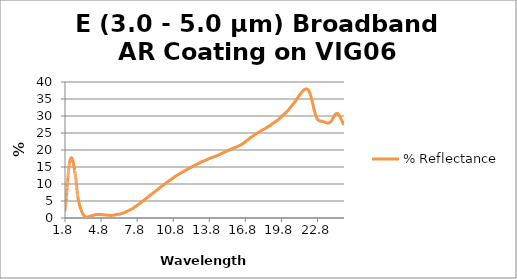
| Category | % Reflectance |
|---|---|
| 1.8 | 1.937 |
| 1.8045 | 2.139 |
| 1.809 | 2.139 |
| 1.8135 | 2.34 |
| 1.818 | 2.34 |
| 1.8225 | 2.561 |
| 1.827 | 2.561 |
| 1.8315 | 2.824 |
| 1.836 | 3.102 |
| 1.8405 | 3.102 |
| 1.845 | 3.387 |
| 1.8495 | 3.387 |
| 1.854 | 3.679 |
| 1.8585 | 3.679 |
| 1.863 | 3.979 |
| 1.8675 | 3.979 |
| 1.872 | 4.293 |
| 1.8765 | 4.615 |
| 1.881 | 4.615 |
| 1.8855 | 4.955 |
| 1.89 | 4.955 |
| 1.8945 | 5.295 |
| 1.899 | 5.295 |
| 1.9035 | 5.64 |
| 1.908 | 5.998 |
| 1.9125 | 5.998 |
| 1.917 | 6.351 |
| 1.9215 | 6.351 |
| 1.926 | 6.713 |
| 1.9305 | 6.713 |
| 1.935 | 7.086 |
| 1.9395 | 7.086 |
| 1.944 | 7.459 |
| 1.9485 | 7.832 |
| 1.953 | 7.832 |
| 1.9575 | 8.203 |
| 1.962 | 8.203 |
| 1.9665 | 8.58 |
| 1.971 | 8.58 |
| 1.9755 | 8.956 |
| 1.98 | 8.956 |
| 1.9845 | 9.327 |
| 1.989 | 9.7 |
| 1.9935 | 9.7 |
| 1.998 | 10.066 |
| 2.0025 | 10.066 |
| 2.007 | 10.426 |
| 2.0115 | 10.426 |
| 2.016 | 10.781 |
| 2.0205 | 11.134 |
| 2.025 | 11.134 |
| 2.0295 | 11.478 |
| 2.034 | 11.478 |
| 2.0385 | 11.82 |
| 2.043 | 11.82 |
| 2.0475 | 12.153 |
| 2.052 | 12.153 |
| 2.0565 | 12.466 |
| 2.061 | 12.778 |
| 2.0655 | 12.778 |
| 2.07 | 13.087 |
| 2.0745 | 13.087 |
| 2.079 | 13.384 |
| 2.0835 | 13.384 |
| 2.088 | 13.677 |
| 2.0925 | 13.677 |
| 2.097 | 13.957 |
| 2.1015 | 14.227 |
| 2.106 | 14.227 |
| 2.1105 | 14.485 |
| 2.115 | 14.485 |
| 2.1195 | 14.73 |
| 2.124 | 14.73 |
| 2.1285 | 14.97 |
| 2.133 | 14.97 |
| 2.1375 | 15.2 |
| 2.142 | 15.42 |
| 2.1465 | 15.42 |
| 2.151 | 15.626 |
| 2.1555 | 15.626 |
| 2.16 | 15.824 |
| 2.1645 | 15.824 |
| 2.169 | 16.016 |
| 2.1735 | 16.195 |
| 2.178 | 16.195 |
| 2.1825 | 16.36 |
| 2.187 | 16.36 |
| 2.1915 | 16.517 |
| 2.196 | 16.517 |
| 2.2005 | 16.664 |
| 2.205 | 16.664 |
| 2.2095 | 16.797 |
| 2.214 | 16.926 |
| 2.2185 | 16.926 |
| 2.223 | 17.049 |
| 2.2275 | 17.049 |
| 2.232 | 17.158 |
| 2.2365 | 17.158 |
| 2.241 | 17.253 |
| 2.2455 | 17.253 |
| 2.25 | 17.34 |
| 2.2545 | 17.42 |
| 2.259 | 17.42 |
| 2.2635 | 17.49 |
| 2.268 | 17.49 |
| 2.2725 | 17.55 |
| 2.277 | 17.55 |
| 2.2815 | 17.6 |
| 2.286 | 17.6 |
| 2.2905 | 17.638 |
| 2.295 | 17.672 |
| 2.2995 | 17.672 |
| 2.304 | 17.697 |
| 2.3085 | 17.697 |
| 2.313 | 17.708 |
| 2.3175 | 17.708 |
| 2.322 | 17.718 |
| 2.3265 | 17.716 |
| 2.331 | 17.716 |
| 2.3355 | 17.7 |
| 2.34 | 17.7 |
| 2.3445 | 17.681 |
| 2.349 | 17.681 |
| 2.3535 | 17.652 |
| 2.358 | 17.652 |
| 2.3625 | 17.616 |
| 2.367 | 17.579 |
| 2.3715 | 17.579 |
| 2.376 | 17.533 |
| 2.3805 | 17.533 |
| 2.385 | 17.481 |
| 2.3895 | 17.481 |
| 2.394 | 17.418 |
| 2.3985 | 17.418 |
| 2.403 | 17.343 |
| 2.4075 | 17.266 |
| 2.412 | 17.266 |
| 2.4165 | 17.185 |
| 2.421 | 17.185 |
| 2.4255 | 17.095 |
| 2.43 | 17.095 |
| 2.4345 | 17 |
| 2.439 | 17 |
| 2.4435 | 16.899 |
| 2.448 | 16.79 |
| 2.4525 | 16.79 |
| 2.457 | 16.681 |
| 2.4615 | 16.681 |
| 2.466 | 16.568 |
| 2.4705 | 16.568 |
| 2.475 | 16.442 |
| 2.4795 | 16.316 |
| 2.484 | 16.316 |
| 2.4885 | 16.186 |
| 2.493 | 16.186 |
| 2.4975 | 16.052 |
| 2.502 | 16.052 |
| 2.5065 | 15.914 |
| 2.511 | 15.914 |
| 2.5155 | 15.769 |
| 2.52 | 15.619 |
| 2.5245 | 15.619 |
| 2.529 | 15.463 |
| 2.5335 | 15.463 |
| 2.538 | 15.308 |
| 2.5425 | 15.308 |
| 2.547 | 15.153 |
| 2.5515 | 15.153 |
| 2.556 | 14.999 |
| 2.5605 | 14.834 |
| 2.565 | 14.834 |
| 2.5695 | 14.662 |
| 2.574 | 14.662 |
| 2.5785 | 14.495 |
| 2.583 | 14.495 |
| 2.5875 | 14.32 |
| 2.592 | 14.136 |
| 2.5965 | 14.136 |
| 2.601 | 13.956 |
| 2.6055 | 13.956 |
| 2.61 | 13.781 |
| 2.6145 | 13.781 |
| 2.619 | 13.591 |
| 2.6235 | 13.591 |
| 2.628 | 13.394 |
| 2.6325 | 13.203 |
| 2.637 | 13.203 |
| 2.6415 | 13.004 |
| 2.646 | 13.004 |
| 2.6505 | 12.81 |
| 2.655 | 12.81 |
| 2.6595 | 12.621 |
| 2.664 | 12.621 |
| 2.6685 | 12.419 |
| 2.673 | 12.202 |
| 2.6775 | 12.202 |
| 2.682 | 11.984 |
| 2.6865 | 11.984 |
| 2.691 | 11.758 |
| 2.6955 | 11.758 |
| 2.7 | 11.521 |
| 2.7045 | 11.521 |
| 2.709 | 11.278 |
| 2.7135 | 11.04 |
| 2.718 | 11.04 |
| 2.7225 | 10.791 |
| 2.727 | 10.791 |
| 2.7315 | 10.527 |
| 2.736 | 10.527 |
| 2.7405 | 10.256 |
| 2.745 | 9.973 |
| 2.7495 | 9.973 |
| 2.754 | 9.659 |
| 2.7585 | 9.659 |
| 2.763 | 9.345 |
| 2.7675 | 9.345 |
| 2.772 | 9.067 |
| 2.7765 | 9.067 |
| 2.781 | 8.784 |
| 2.7855 | 8.481 |
| 2.79 | 8.481 |
| 2.7945 | 8.181 |
| 2.799 | 8.181 |
| 2.8035 | 7.898 |
| 2.808 | 7.898 |
| 2.8125 | 7.626 |
| 2.817 | 7.626 |
| 2.8215 | 7.373 |
| 2.826 | 7.136 |
| 2.8305 | 7.136 |
| 2.835 | 6.91 |
| 2.8395 | 6.91 |
| 2.844 | 6.705 |
| 2.8485 | 6.705 |
| 2.853 | 6.514 |
| 2.8575 | 6.514 |
| 2.862 | 6.323 |
| 2.8665 | 6.142 |
| 2.871 | 6.142 |
| 2.8755 | 5.969 |
| 2.88 | 5.969 |
| 2.8845 | 5.796 |
| 2.889 | 5.796 |
| 2.8935 | 5.629 |
| 2.898 | 5.473 |
| 2.9025 | 5.473 |
| 2.907 | 5.321 |
| 2.9115 | 5.321 |
| 2.916 | 5.174 |
| 2.9205 | 5.174 |
| 2.925 | 5.037 |
| 2.9295 | 5.037 |
| 2.934 | 4.905 |
| 2.9385 | 4.776 |
| 2.943 | 4.776 |
| 2.9475 | 4.65 |
| 2.952 | 4.65 |
| 2.9565 | 4.531 |
| 2.961 | 4.531 |
| 2.9655 | 4.417 |
| 2.97 | 4.417 |
| 2.9745 | 4.304 |
| 2.979 | 4.192 |
| 2.9835 | 4.192 |
| 2.988 | 4.085 |
| 2.9925 | 4.085 |
| 2.997 | 3.982 |
| 3.0015 | 3.982 |
| 3.006 | 3.878 |
| 3.0105 | 3.878 |
| 3.015 | 3.777 |
| 3.0195 | 3.675 |
| 3.024 | 3.675 |
| 3.0285 | 3.574 |
| 3.033 | 3.574 |
| 3.0375 | 3.474 |
| 3.042 | 3.474 |
| 3.0465 | 3.374 |
| 3.051 | 3.28 |
| 3.0555 | 3.28 |
| 3.06 | 3.189 |
| 3.0645 | 3.189 |
| 3.069 | 3.095 |
| 3.0735 | 3.095 |
| 3.078 | 3.001 |
| 3.0825 | 3.001 |
| 3.087 | 2.913 |
| 3.0915 | 2.831 |
| 3.096 | 2.831 |
| 3.1005 | 2.743 |
| 3.105 | 2.743 |
| 3.1095 | 2.658 |
| 3.114 | 2.658 |
| 3.1185 | 2.581 |
| 3.123 | 2.581 |
| 3.1275 | 2.502 |
| 3.132 | 2.421 |
| 3.1365 | 2.421 |
| 3.141 | 2.348 |
| 3.1455 | 2.348 |
| 3.15 | 2.274 |
| 3.1545 | 2.274 |
| 3.159 | 2.2 |
| 3.1635 | 2.2 |
| 3.168 | 2.127 |
| 3.1725 | 2.051 |
| 3.177 | 2.051 |
| 3.1815 | 1.981 |
| 3.186 | 1.981 |
| 3.1905 | 1.911 |
| 3.195 | 1.911 |
| 3.1995 | 1.842 |
| 3.204 | 1.779 |
| 3.2085 | 1.779 |
| 3.213 | 1.716 |
| 3.2175 | 1.716 |
| 3.222 | 1.649 |
| 3.2265 | 1.649 |
| 3.231 | 1.585 |
| 3.2355 | 1.585 |
| 3.24 | 1.526 |
| 3.2445 | 1.463 |
| 3.249 | 1.463 |
| 3.2535 | 1.402 |
| 3.258 | 1.402 |
| 3.2625 | 1.347 |
| 3.267 | 1.347 |
| 3.2715 | 1.294 |
| 3.276 | 1.294 |
| 3.2805 | 1.239 |
| 3.285 | 1.188 |
| 3.2895 | 1.188 |
| 3.294 | 1.139 |
| 3.2985 | 1.139 |
| 3.303 | 1.091 |
| 3.3075 | 1.091 |
| 3.312 | 1.04 |
| 3.3165 | 0.992 |
| 3.321 | 0.992 |
| 3.3255 | 0.953 |
| 3.33 | 0.953 |
| 3.3345 | 0.91 |
| 3.339 | 0.91 |
| 3.3435 | 0.864 |
| 3.348 | 0.864 |
| 3.3525 | 0.818 |
| 3.357 | 0.774 |
| 3.3615 | 0.774 |
| 3.366 | 0.733 |
| 3.3705 | 0.733 |
| 3.375 | 0.699 |
| 3.3795 | 0.699 |
| 3.384 | 0.669 |
| 3.3885 | 0.669 |
| 3.393 | 0.635 |
| 3.3975 | 0.601 |
| 3.402 | 0.601 |
| 3.4065 | 0.571 |
| 3.411 | 0.571 |
| 3.4155 | 0.552 |
| 3.42 | 0.552 |
| 3.4245 | 0.537 |
| 3.429 | 0.537 |
| 3.4335 | 0.521 |
| 3.438 | 0.503 |
| 3.4425 | 0.503 |
| 3.447 | 0.485 |
| 3.4515 | 0.485 |
| 3.456 | 0.464 |
| 3.4605 | 0.464 |
| 3.465 | 0.44 |
| 3.4695 | 0.42 |
| 3.474 | 0.42 |
| 3.4785 | 0.401 |
| 3.483 | 0.401 |
| 3.4875 | 0.384 |
| 3.492 | 0.384 |
| 3.4965 | 0.368 |
| 3.501 | 0.368 |
| 3.5055 | 0.357 |
| 3.51 | 0.35 |
| 3.5145 | 0.35 |
| 3.519 | 0.342 |
| 3.5235 | 0.342 |
| 3.528 | 0.331 |
| 3.5325 | 0.331 |
| 3.537 | 0.32 |
| 3.5415 | 0.32 |
| 3.546 | 0.315 |
| 3.5505 | 0.309 |
| 3.555 | 0.309 |
| 3.5595 | 0.297 |
| 3.564 | 0.297 |
| 3.5685 | 0.289 |
| 3.573 | 0.289 |
| 3.5775 | 0.286 |
| 3.582 | 0.286 |
| 3.5865 | 0.284 |
| 3.591 | 0.28 |
| 3.5955 | 0.28 |
| 3.6 | 0.276 |
| 3.6045 | 0.276 |
| 3.609 | 0.273 |
| 3.6135 | 0.273 |
| 3.618 | 0.272 |
| 3.6225 | 0.27 |
| 3.627 | 0.27 |
| 3.6315 | 0.268 |
| 3.636 | 0.268 |
| 3.6405 | 0.266 |
| 3.645 | 0.266 |
| 3.6495 | 0.268 |
| 3.654 | 0.268 |
| 3.6585 | 0.269 |
| 3.663 | 0.271 |
| 3.6675 | 0.271 |
| 3.672 | 0.275 |
| 3.6765 | 0.275 |
| 3.681 | 0.279 |
| 3.6855 | 0.279 |
| 3.69 | 0.284 |
| 3.6945 | 0.284 |
| 3.699 | 0.288 |
| 3.7035 | 0.292 |
| 3.708 | 0.292 |
| 3.7125 | 0.297 |
| 3.717 | 0.297 |
| 3.7215 | 0.299 |
| 3.726 | 0.299 |
| 3.7305 | 0.304 |
| 3.735 | 0.304 |
| 3.7395 | 0.312 |
| 3.744 | 0.319 |
| 3.7485 | 0.319 |
| 3.753 | 0.326 |
| 3.7575 | 0.326 |
| 3.762 | 0.334 |
| 3.7665 | 0.334 |
| 3.771 | 0.342 |
| 3.7755 | 0.348 |
| 3.78 | 0.348 |
| 3.7845 | 0.356 |
| 3.789 | 0.356 |
| 3.7935 | 0.362 |
| 3.798 | 0.362 |
| 3.8025 | 0.372 |
| 3.807 | 0.372 |
| 3.8115 | 0.384 |
| 3.816 | 0.391 |
| 3.8205 | 0.391 |
| 3.825 | 0.402 |
| 3.8295 | 0.402 |
| 3.834 | 0.413 |
| 3.8385 | 0.413 |
| 3.843 | 0.423 |
| 3.8475 | 0.423 |
| 3.852 | 0.433 |
| 3.8565 | 0.444 |
| 3.861 | 0.444 |
| 3.8655 | 0.453 |
| 3.87 | 0.453 |
| 3.8745 | 0.464 |
| 3.879 | 0.464 |
| 3.8835 | 0.476 |
| 3.888 | 0.486 |
| 3.8925 | 0.486 |
| 3.897 | 0.496 |
| 3.9015 | 0.496 |
| 3.906 | 0.507 |
| 3.9105 | 0.507 |
| 3.915 | 0.519 |
| 3.9195 | 0.519 |
| 3.924 | 0.527 |
| 3.9285 | 0.536 |
| 3.933 | 0.536 |
| 3.9375 | 0.547 |
| 3.942 | 0.547 |
| 3.9465 | 0.557 |
| 3.951 | 0.557 |
| 3.9555 | 0.567 |
| 3.96 | 0.567 |
| 3.9645 | 0.577 |
| 3.969 | 0.588 |
| 3.9735 | 0.588 |
| 3.978 | 0.597 |
| 3.9825 | 0.597 |
| 3.987 | 0.605 |
| 3.9915 | 0.605 |
| 3.996 | 0.616 |
| 4.0005 | 0.616 |
| 4.005 | 0.627 |
| 4.0095 | 0.637 |
| 4.014 | 0.637 |
| 4.0185 | 0.648 |
| 4.023 | 0.648 |
| 4.0275 | 0.655 |
| 4.032 | 0.655 |
| 4.0365 | 0.664 |
| 4.041 | 0.674 |
| 4.0455 | 0.674 |
| 4.05 | 0.684 |
| 4.0545 | 0.684 |
| 4.059 | 0.694 |
| 4.0635 | 0.694 |
| 4.068 | 0.705 |
| 4.0725 | 0.705 |
| 4.077 | 0.715 |
| 4.0815 | 0.722 |
| 4.086 | 0.722 |
| 4.0905 | 0.732 |
| 4.095 | 0.732 |
| 4.0995 | 0.74 |
| 4.104 | 0.74 |
| 4.1085 | 0.749 |
| 4.113 | 0.749 |
| 4.1175 | 0.76 |
| 4.122 | 0.771 |
| 4.1265 | 0.771 |
| 4.131 | 0.779 |
| 4.1355 | 0.779 |
| 4.14 | 0.788 |
| 4.1445 | 0.788 |
| 4.149 | 0.799 |
| 4.1535 | 0.799 |
| 4.158 | 0.806 |
| 4.1625 | 0.815 |
| 4.167 | 0.815 |
| 4.1715 | 0.826 |
| 4.176 | 0.826 |
| 4.1805 | 0.835 |
| 4.185 | 0.835 |
| 4.1895 | 0.844 |
| 4.194 | 0.853 |
| 4.1985 | 0.853 |
| 4.203 | 0.864 |
| 4.2075 | 0.864 |
| 4.212 | 0.875 |
| 4.2165 | 0.875 |
| 4.221 | 0.883 |
| 4.2255 | 0.883 |
| 4.23 | 0.889 |
| 4.2345 | 0.896 |
| 4.239 | 0.896 |
| 4.2435 | 0.903 |
| 4.248 | 0.903 |
| 4.2525 | 0.912 |
| 4.257 | 0.912 |
| 4.2615 | 0.919 |
| 4.266 | 0.919 |
| 4.2705 | 0.925 |
| 4.275 | 0.933 |
| 4.2795 | 0.933 |
| 4.284 | 0.94 |
| 4.2885 | 0.94 |
| 4.293 | 0.946 |
| 4.2975 | 0.946 |
| 4.302 | 0.951 |
| 4.3065 | 0.951 |
| 4.311 | 0.957 |
| 4.3155 | 0.964 |
| 4.32 | 0.964 |
| 4.3245 | 0.967 |
| 4.329 | 0.967 |
| 4.3335 | 0.97 |
| 4.338 | 0.97 |
| 4.3425 | 0.976 |
| 4.347 | 0.981 |
| 4.3515 | 0.981 |
| 4.356 | 0.987 |
| 4.3605 | 0.987 |
| 4.365 | 0.993 |
| 4.3695 | 0.993 |
| 4.374 | 0.998 |
| 4.3785 | 0.998 |
| 4.383 | 1.003 |
| 4.3875 | 1.006 |
| 4.392 | 1.006 |
| 4.3965 | 1.009 |
| 4.401 | 1.009 |
| 4.4055 | 1.011 |
| 4.41 | 1.011 |
| 4.4145 | 1.014 |
| 4.419 | 1.014 |
| 4.4235 | 1.02 |
| 4.428 | 1.024 |
| 4.4325 | 1.024 |
| 4.437 | 1.025 |
| 4.4415 | 1.025 |
| 4.446 | 1.025 |
| 4.4505 | 1.025 |
| 4.455 | 1.025 |
| 4.4595 | 1.025 |
| 4.464 | 1.025 |
| 4.4685 | 1.028 |
| 4.473 | 1.028 |
| 4.4775 | 1.032 |
| 4.482 | 1.032 |
| 4.4865 | 1.038 |
| 4.491 | 1.038 |
| 4.4955 | 1.039 |
| 4.5 | 1.04 |
| 4.5045 | 1.04 |
| 4.509 | 1.044 |
| 4.5135 | 1.044 |
| 4.518 | 1.046 |
| 4.5225 | 1.046 |
| 4.527 | 1.048 |
| 4.5315 | 1.048 |
| 4.536 | 1.048 |
| 4.5405 | 1.048 |
| 4.545 | 1.048 |
| 4.5495 | 1.051 |
| 4.554 | 1.051 |
| 4.5585 | 1.055 |
| 4.563 | 1.055 |
| 4.5675 | 1.055 |
| 4.572 | 1.055 |
| 4.5765 | 1.053 |
| 4.581 | 1.054 |
| 4.5855 | 1.054 |
| 4.59 | 1.058 |
| 4.5945 | 1.058 |
| 4.599 | 1.061 |
| 4.6035 | 1.061 |
| 4.608 | 1.06 |
| 4.6125 | 1.059 |
| 4.617 | 1.059 |
| 4.6215 | 1.058 |
| 4.626 | 1.058 |
| 4.6305 | 1.059 |
| 4.635 | 1.059 |
| 4.6395 | 1.058 |
| 4.644 | 1.058 |
| 4.6485 | 1.056 |
| 4.653 | 1.058 |
| 4.6575 | 1.058 |
| 4.662 | 1.059 |
| 4.6665 | 1.059 |
| 4.671 | 1.057 |
| 4.6755 | 1.057 |
| 4.68 | 1.057 |
| 4.6845 | 1.057 |
| 4.689 | 1.057 |
| 4.6935 | 1.056 |
| 4.698 | 1.056 |
| 4.7025 | 1.054 |
| 4.707 | 1.054 |
| 4.7115 | 1.052 |
| 4.716 | 1.052 |
| 4.7205 | 1.05 |
| 4.725 | 1.05 |
| 4.7295 | 1.049 |
| 4.734 | 1.048 |
| 4.7385 | 1.048 |
| 4.743 | 1.047 |
| 4.7475 | 1.047 |
| 4.752 | 1.046 |
| 4.7565 | 1.046 |
| 4.761 | 1.044 |
| 4.7655 | 1.042 |
| 4.77 | 1.042 |
| 4.7745 | 1.041 |
| 4.779 | 1.041 |
| 4.7835 | 1.039 |
| 4.788 | 1.039 |
| 4.7925 | 1.035 |
| 4.797 | 1.035 |
| 4.8015 | 1.031 |
| 4.806 | 1.03 |
| 4.8105 | 1.03 |
| 4.815 | 1.029 |
| 4.8195 | 1.029 |
| 4.824 | 1.025 |
| 4.8285 | 1.025 |
| 4.833 | 1.023 |
| 4.8375 | 1.023 |
| 4.842 | 1.022 |
| 4.8465 | 1.018 |
| 4.851 | 1.018 |
| 4.8555 | 1.013 |
| 4.86 | 1.013 |
| 4.8645 | 1.009 |
| 4.869 | 1.009 |
| 4.8735 | 1.006 |
| 4.878 | 1.006 |
| 4.8825 | 1.004 |
| 4.887 | 1.003 |
| 4.8915 | 1.003 |
| 4.896 | 1.001 |
| 4.9005 | 1.001 |
| 4.905 | 0.996 |
| 4.9095 | 0.996 |
| 4.914 | 0.99 |
| 4.9185 | 0.986 |
| 4.923 | 0.986 |
| 4.9275 | 0.983 |
| 4.932 | 0.983 |
| 4.9365 | 0.979 |
| 4.941 | 0.979 |
| 4.9455 | 0.976 |
| 4.95 | 0.976 |
| 4.9545 | 0.973 |
| 4.959 | 0.969 |
| 4.9635 | 0.969 |
| 4.968 | 0.965 |
| 4.9725 | 0.965 |
| 4.977 | 0.962 |
| 4.9815 | 0.962 |
| 4.986 | 0.959 |
| 4.9905 | 0.959 |
| 4.995 | 0.957 |
| 4.9995 | 0.953 |
| 5.004 | 0.953 |
| 5.0085 | 0.948 |
| 5.013 | 0.948 |
| 5.0175 | 0.945 |
| 5.022 | 0.945 |
| 5.0265 | 0.942 |
| 5.031 | 0.942 |
| 5.0355 | 0.935 |
| 5.04 | 0.929 |
| 5.0445 | 0.929 |
| 5.049 | 0.927 |
| 5.0535 | 0.927 |
| 5.058 | 0.925 |
| 5.0625 | 0.925 |
| 5.067 | 0.922 |
| 5.0715 | 0.92 |
| 5.076 | 0.92 |
| 5.0805 | 0.917 |
| 5.085 | 0.917 |
| 5.0895 | 0.912 |
| 5.094 | 0.912 |
| 5.0985 | 0.908 |
| 5.103 | 0.908 |
| 5.1075 | 0.904 |
| 5.112 | 0.899 |
| 5.1165 | 0.899 |
| 5.121 | 0.894 |
| 5.1255 | 0.894 |
| 5.13 | 0.891 |
| 5.1345 | 0.891 |
| 5.139 | 0.892 |
| 5.1435 | 0.892 |
| 5.148 | 0.892 |
| 5.1525 | 0.889 |
| 5.157 | 0.889 |
| 5.1615 | 0.886 |
| 5.166 | 0.886 |
| 5.1705 | 0.883 |
| 5.175 | 0.883 |
| 5.1795 | 0.879 |
| 5.184 | 0.874 |
| 5.1885 | 0.874 |
| 5.193 | 0.869 |
| 5.1975 | 0.869 |
| 5.202 | 0.865 |
| 5.2065 | 0.865 |
| 5.211 | 0.861 |
| 5.2155 | 0.861 |
| 5.22 | 0.858 |
| 5.2245 | 0.857 |
| 5.229 | 0.857 |
| 5.2335 | 0.856 |
| 5.238 | 0.856 |
| 5.2425 | 0.851 |
| 5.247 | 0.851 |
| 5.2515 | 0.848 |
| 5.256 | 0.848 |
| 5.2605 | 0.846 |
| 5.265 | 0.845 |
| 5.2695 | 0.845 |
| 5.274 | 0.843 |
| 5.2785 | 0.843 |
| 5.283 | 0.839 |
| 5.2875 | 0.839 |
| 5.292 | 0.835 |
| 5.2965 | 0.835 |
| 5.301 | 0.832 |
| 5.3055 | 0.829 |
| 5.31 | 0.829 |
| 5.3145 | 0.824 |
| 5.319 | 0.824 |
| 5.3235 | 0.821 |
| 5.328 | 0.821 |
| 5.3325 | 0.819 |
| 5.337 | 0.818 |
| 5.3415 | 0.818 |
| 5.346 | 0.817 |
| 5.3505 | 0.817 |
| 5.355 | 0.816 |
| 5.3595 | 0.816 |
| 5.364 | 0.816 |
| 5.3685 | 0.816 |
| 5.373 | 0.813 |
| 5.3775 | 0.809 |
| 5.382 | 0.809 |
| 5.3865 | 0.806 |
| 5.391 | 0.806 |
| 5.3955 | 0.805 |
| 5.4 | 0.805 |
| 5.4045 | 0.803 |
| 5.409 | 0.803 |
| 5.4135 | 0.802 |
| 5.418 | 0.8 |
| 5.4225 | 0.8 |
| 5.427 | 0.798 |
| 5.4315 | 0.798 |
| 5.436 | 0.795 |
| 5.4405 | 0.795 |
| 5.445 | 0.793 |
| 5.4495 | 0.793 |
| 5.454 | 0.79 |
| 5.4585 | 0.787 |
| 5.463 | 0.787 |
| 5.4675 | 0.783 |
| 5.472 | 0.783 |
| 5.4765 | 0.781 |
| 5.481 | 0.781 |
| 5.4855 | 0.78 |
| 5.49 | 0.78 |
| 5.4945 | 0.78 |
| 5.499 | 0.779 |
| 5.5035 | 0.779 |
| 5.508 | 0.778 |
| 5.5125 | 0.778 |
| 5.517 | 0.777 |
| 5.5215 | 0.777 |
| 5.526 | 0.775 |
| 5.5305 | 0.773 |
| 5.535 | 0.773 |
| 5.5395 | 0.772 |
| 5.544 | 0.772 |
| 5.5485 | 0.771 |
| 5.553 | 0.771 |
| 5.5575 | 0.769 |
| 5.562 | 0.769 |
| 5.5665 | 0.767 |
| 5.571 | 0.766 |
| 5.5755 | 0.766 |
| 5.58 | 0.763 |
| 5.5845 | 0.763 |
| 5.589 | 0.76 |
| 5.5935 | 0.76 |
| 5.598 | 0.761 |
| 5.6025 | 0.761 |
| 5.607 | 0.764 |
| 5.6115 | 0.767 |
| 5.616 | 0.767 |
| 5.6205 | 0.769 |
| 5.625 | 0.769 |
| 5.6295 | 0.769 |
| 5.634 | 0.769 |
| 5.6385 | 0.769 |
| 5.643 | 0.767 |
| 5.6475 | 0.767 |
| 5.652 | 0.766 |
| 5.6565 | 0.766 |
| 5.661 | 0.765 |
| 5.6655 | 0.765 |
| 5.67 | 0.765 |
| 5.6745 | 0.765 |
| 5.679 | 0.764 |
| 5.6835 | 0.765 |
| 5.688 | 0.765 |
| 5.6925 | 0.769 |
| 5.697 | 0.769 |
| 5.7015 | 0.773 |
| 5.706 | 0.773 |
| 5.7105 | 0.776 |
| 5.715 | 0.776 |
| 5.7195 | 0.778 |
| 5.724 | 0.779 |
| 5.7285 | 0.779 |
| 5.733 | 0.781 |
| 5.7375 | 0.781 |
| 5.742 | 0.781 |
| 5.7465 | 0.781 |
| 5.751 | 0.782 |
| 5.7555 | 0.782 |
| 5.76 | 0.784 |
| 5.7645 | 0.789 |
| 5.769 | 0.789 |
| 5.7735 | 0.793 |
| 5.778 | 0.793 |
| 5.7825 | 0.794 |
| 5.787 | 0.794 |
| 5.7915 | 0.794 |
| 5.796 | 0.798 |
| 5.8005 | 0.798 |
| 5.805 | 0.805 |
| 5.8095 | 0.805 |
| 5.814 | 0.813 |
| 5.8185 | 0.813 |
| 5.823 | 0.819 |
| 5.8275 | 0.819 |
| 5.832 | 0.823 |
| 5.8365 | 0.826 |
| 5.841 | 0.826 |
| 5.8455 | 0.829 |
| 5.85 | 0.829 |
| 5.8545 | 0.833 |
| 5.859 | 0.833 |
| 5.8635 | 0.838 |
| 5.868 | 0.838 |
| 5.8725 | 0.843 |
| 5.877 | 0.848 |
| 5.8815 | 0.848 |
| 5.886 | 0.853 |
| 5.8905 | 0.853 |
| 5.895 | 0.859 |
| 5.8995 | 0.859 |
| 5.904 | 0.867 |
| 5.9085 | 0.877 |
| 5.913 | 0.877 |
| 5.9175 | 0.886 |
| 5.922 | 0.886 |
| 5.9265 | 0.894 |
| 5.931 | 0.894 |
| 5.9355 | 0.903 |
| 5.94 | 0.903 |
| 5.9445 | 0.911 |
| 5.949 | 0.92 |
| 5.9535 | 0.92 |
| 5.958 | 0.93 |
| 5.9625 | 0.93 |
| 5.967 | 0.94 |
| 5.9715 | 0.94 |
| 5.976 | 0.95 |
| 5.9805 | 0.95 |
| 5.985 | 0.959 |
| 5.9895 | 0.966 |
| 5.994 | 0.966 |
| 5.9985 | 0.972 |
| 6.003 | 0.972 |
| 6.0075 | 0.979 |
| 6.012 | 0.979 |
| 6.0165 | 0.988 |
| 6.021 | 0.988 |
| 6.0255 | 0.997 |
| 6.03 | 1.006 |
| 6.0345 | 1.006 |
| 6.039 | 1.016 |
| 6.0435 | 1.016 |
| 6.048 | 1.024 |
| 6.0525 | 1.024 |
| 6.057 | 1.029 |
| 6.0615 | 1.033 |
| 6.066 | 1.033 |
| 6.0705 | 1.038 |
| 6.075 | 1.038 |
| 6.0795 | 1.043 |
| 6.084 | 1.043 |
| 6.0885 | 1.048 |
| 6.093 | 1.048 |
| 6.0975 | 1.053 |
| 6.102 | 1.056 |
| 6.1065 | 1.056 |
| 6.111 | 1.058 |
| 6.1155 | 1.058 |
| 6.12 | 1.06 |
| 6.1245 | 1.06 |
| 6.129 | 1.061 |
| 6.1335 | 1.061 |
| 6.138 | 1.064 |
| 6.1425 | 1.067 |
| 6.147 | 1.067 |
| 6.1515 | 1.068 |
| 6.156 | 1.068 |
| 6.1605 | 1.067 |
| 6.165 | 1.067 |
| 6.1695 | 1.068 |
| 6.174 | 1.068 |
| 6.1785 | 1.072 |
| 6.183 | 1.076 |
| 6.1875 | 1.076 |
| 6.192 | 1.077 |
| 6.1965 | 1.077 |
| 6.201 | 1.076 |
| 6.2055 | 1.076 |
| 6.21 | 1.075 |
| 6.2145 | 1.075 |
| 6.219 | 1.075 |
| 6.2235 | 1.075 |
| 6.228 | 1.075 |
| 6.2325 | 1.077 |
| 6.237 | 1.077 |
| 6.2415 | 1.079 |
| 6.246 | 1.079 |
| 6.2505 | 1.083 |
| 6.255 | 1.088 |
| 6.2595 | 1.088 |
| 6.264 | 1.091 |
| 6.2685 | 1.091 |
| 6.273 | 1.093 |
| 6.2775 | 1.093 |
| 6.282 | 1.094 |
| 6.2865 | 1.094 |
| 6.291 | 1.095 |
| 6.2955 | 1.097 |
| 6.3 | 1.097 |
| 6.3045 | 1.101 |
| 6.309 | 1.101 |
| 6.3135 | 1.105 |
| 6.318 | 1.105 |
| 6.3225 | 1.11 |
| 6.327 | 1.11 |
| 6.3315 | 1.117 |
| 6.336 | 1.124 |
| 6.3405 | 1.124 |
| 6.345 | 1.132 |
| 6.3495 | 1.132 |
| 6.354 | 1.138 |
| 6.3585 | 1.138 |
| 6.363 | 1.143 |
| 6.3675 | 1.148 |
| 6.372 | 1.148 |
| 6.3765 | 1.155 |
| 6.381 | 1.155 |
| 6.3855 | 1.163 |
| 6.39 | 1.163 |
| 6.3945 | 1.17 |
| 6.399 | 1.17 |
| 6.4035 | 1.179 |
| 6.408 | 1.188 |
| 6.4125 | 1.188 |
| 6.417 | 1.199 |
| 6.4215 | 1.199 |
| 6.426 | 1.207 |
| 6.4305 | 1.207 |
| 6.435 | 1.213 |
| 6.4395 | 1.213 |
| 6.444 | 1.218 |
| 6.4485 | 1.224 |
| 6.453 | 1.224 |
| 6.4575 | 1.231 |
| 6.462 | 1.231 |
| 6.4665 | 1.239 |
| 6.471 | 1.239 |
| 6.4755 | 1.249 |
| 6.48 | 1.259 |
| 6.4845 | 1.259 |
| 6.489 | 1.268 |
| 6.4935 | 1.268 |
| 6.498 | 1.277 |
| 6.5025 | 1.277 |
| 6.507 | 1.286 |
| 6.5115 | 1.286 |
| 6.516 | 1.297 |
| 6.5205 | 1.307 |
| 6.525 | 1.307 |
| 6.5295 | 1.316 |
| 6.534 | 1.316 |
| 6.5385 | 1.325 |
| 6.543 | 1.325 |
| 6.5475 | 1.333 |
| 6.552 | 1.333 |
| 6.5565 | 1.343 |
| 6.561 | 1.354 |
| 6.5655 | 1.354 |
| 6.57 | 1.364 |
| 6.5745 | 1.364 |
| 6.579 | 1.373 |
| 6.5835 | 1.373 |
| 6.588 | 1.383 |
| 6.5925 | 1.383 |
| 6.597 | 1.393 |
| 6.6015 | 1.404 |
| 6.606 | 1.404 |
| 6.6105 | 1.416 |
| 6.615 | 1.416 |
| 6.6195 | 1.427 |
| 6.624 | 1.427 |
| 6.6285 | 1.439 |
| 6.633 | 1.45 |
| 6.6375 | 1.45 |
| 6.642 | 1.461 |
| 6.6465 | 1.461 |
| 6.651 | 1.472 |
| 6.6555 | 1.472 |
| 6.66 | 1.484 |
| 6.6645 | 1.484 |
| 6.669 | 1.497 |
| 6.6735 | 1.508 |
| 6.678 | 1.508 |
| 6.6825 | 1.519 |
| 6.687 | 1.519 |
| 6.6915 | 1.529 |
| 6.696 | 1.529 |
| 6.7005 | 1.541 |
| 6.705 | 1.541 |
| 6.7095 | 1.554 |
| 6.714 | 1.568 |
| 6.7185 | 1.568 |
| 6.723 | 1.582 |
| 6.7275 | 1.582 |
| 6.732 | 1.595 |
| 6.7365 | 1.595 |
| 6.741 | 1.606 |
| 6.7455 | 1.606 |
| 6.75 | 1.618 |
| 6.7545 | 1.632 |
| 6.759 | 1.632 |
| 6.7635 | 1.648 |
| 6.768 | 1.648 |
| 6.7725 | 1.664 |
| 6.777 | 1.664 |
| 6.7815 | 1.679 |
| 6.786 | 1.692 |
| 6.7905 | 1.692 |
| 6.795 | 1.702 |
| 6.7995 | 1.702 |
| 6.804 | 1.712 |
| 6.8085 | 1.712 |
| 6.813 | 1.723 |
| 6.8175 | 1.723 |
| 6.822 | 1.735 |
| 6.8265 | 1.747 |
| 6.831 | 1.747 |
| 6.8355 | 1.76 |
| 6.84 | 1.76 |
| 6.8445 | 1.773 |
| 6.849 | 1.773 |
| 6.8535 | 1.787 |
| 6.858 | 1.787 |
| 6.8625 | 1.803 |
| 6.867 | 1.819 |
| 6.8715 | 1.819 |
| 6.876 | 1.834 |
| 6.8805 | 1.834 |
| 6.885 | 1.848 |
| 6.8895 | 1.848 |
| 6.894 | 1.861 |
| 6.8985 | 1.861 |
| 6.903 | 1.873 |
| 6.9075 | 1.885 |
| 6.912 | 1.885 |
| 6.9165 | 1.898 |
| 6.921 | 1.898 |
| 6.9255 | 1.912 |
| 6.93 | 1.912 |
| 6.9345 | 1.928 |
| 6.939 | 1.942 |
| 6.9435 | 1.942 |
| 6.948 | 1.957 |
| 6.9525 | 1.957 |
| 6.957 | 1.97 |
| 6.9615 | 1.97 |
| 6.966 | 1.983 |
| 6.9705 | 1.983 |
| 6.975 | 1.995 |
| 6.9795 | 2.006 |
| 6.984 | 2.006 |
| 6.9885 | 2.018 |
| 6.993 | 2.018 |
| 6.9975 | 2.031 |
| 7.002 | 2.031 |
| 7.0065 | 2.043 |
| 7.011 | 2.043 |
| 7.0155 | 2.055 |
| 7.02 | 2.066 |
| 7.0245 | 2.066 |
| 7.029 | 2.077 |
| 7.0335 | 2.077 |
| 7.038 | 2.088 |
| 7.0425 | 2.088 |
| 7.047 | 2.1 |
| 7.0515 | 2.1 |
| 7.056 | 2.112 |
| 7.0605 | 2.125 |
| 7.065 | 2.125 |
| 7.0695 | 2.138 |
| 7.074 | 2.138 |
| 7.0785 | 2.151 |
| 7.083 | 2.151 |
| 7.0875 | 2.164 |
| 7.092 | 2.177 |
| 7.0965 | 2.177 |
| 7.101 | 2.191 |
| 7.1055 | 2.191 |
| 7.11 | 2.205 |
| 7.1145 | 2.205 |
| 7.119 | 2.219 |
| 7.1235 | 2.219 |
| 7.128 | 2.231 |
| 7.1325 | 2.242 |
| 7.137 | 2.242 |
| 7.1415 | 2.255 |
| 7.146 | 2.255 |
| 7.1505 | 2.268 |
| 7.155 | 2.268 |
| 7.1595 | 2.282 |
| 7.164 | 2.282 |
| 7.1685 | 2.297 |
| 7.173 | 2.313 |
| 7.1775 | 2.313 |
| 7.182 | 2.33 |
| 7.1865 | 2.33 |
| 7.191 | 2.346 |
| 7.1955 | 2.346 |
| 7.2 | 2.361 |
| 7.2045 | 2.376 |
| 7.209 | 2.376 |
| 7.2135 | 2.391 |
| 7.218 | 2.391 |
| 7.2225 | 2.406 |
| 7.227 | 2.406 |
| 7.2315 | 2.423 |
| 7.236 | 2.423 |
| 7.2405 | 2.439 |
| 7.245 | 2.454 |
| 7.2495 | 2.454 |
| 7.254 | 2.468 |
| 7.2585 | 2.468 |
| 7.263 | 2.482 |
| 7.2675 | 2.482 |
| 7.272 | 2.496 |
| 7.2765 | 2.496 |
| 7.281 | 2.51 |
| 7.2855 | 2.524 |
| 7.29 | 2.524 |
| 7.2945 | 2.539 |
| 7.299 | 2.539 |
| 7.3035 | 2.554 |
| 7.308 | 2.554 |
| 7.3125 | 2.569 |
| 7.317 | 2.569 |
| 7.3215 | 2.584 |
| 7.326 | 2.599 |
| 7.3305 | 2.599 |
| 7.335 | 2.615 |
| 7.3395 | 2.615 |
| 7.344 | 2.63 |
| 7.3485 | 2.63 |
| 7.353 | 2.646 |
| 7.3575 | 2.661 |
| 7.362 | 2.661 |
| 7.3665 | 2.677 |
| 7.371 | 2.677 |
| 7.3755 | 2.695 |
| 7.38 | 2.695 |
| 7.3845 | 2.714 |
| 7.389 | 2.714 |
| 7.3935 | 2.734 |
| 7.398 | 2.755 |
| 7.4025 | 2.755 |
| 7.407 | 2.774 |
| 7.4115 | 2.774 |
| 7.416 | 2.793 |
| 7.4205 | 2.793 |
| 7.425 | 2.811 |
| 7.4295 | 2.811 |
| 7.434 | 2.829 |
| 7.4385 | 2.846 |
| 7.443 | 2.846 |
| 7.4475 | 2.863 |
| 7.452 | 2.863 |
| 7.4565 | 2.88 |
| 7.461 | 2.88 |
| 7.4655 | 2.897 |
| 7.47 | 2.897 |
| 7.4745 | 2.915 |
| 7.479 | 2.933 |
| 7.4835 | 2.933 |
| 7.488 | 2.952 |
| 7.4925 | 2.952 |
| 7.497 | 2.971 |
| 7.5015 | 2.971 |
| 7.506 | 2.99 |
| 7.5105 | 3.01 |
| 7.515 | 3.01 |
| 7.5195 | 3.031 |
| 7.524 | 3.031 |
| 7.5285 | 3.052 |
| 7.533 | 3.052 |
| 7.5375 | 3.073 |
| 7.542 | 3.073 |
| 7.5465 | 3.094 |
| 7.551 | 3.114 |
| 7.5555 | 3.114 |
| 7.56 | 3.133 |
| 7.5645 | 3.133 |
| 7.569 | 3.151 |
| 7.5735 | 3.151 |
| 7.578 | 3.17 |
| 7.5825 | 3.17 |
| 7.587 | 3.189 |
| 7.5915 | 3.209 |
| 7.596 | 3.209 |
| 7.6005 | 3.23 |
| 7.605 | 3.23 |
| 7.6095 | 3.252 |
| 7.614 | 3.252 |
| 7.6185 | 3.274 |
| 7.623 | 3.274 |
| 7.6275 | 3.295 |
| 7.632 | 3.317 |
| 7.6365 | 3.317 |
| 7.641 | 3.339 |
| 7.6455 | 3.339 |
| 7.65 | 3.36 |
| 7.6545 | 3.36 |
| 7.659 | 3.379 |
| 7.6635 | 3.397 |
| 7.668 | 3.397 |
| 7.6725 | 3.414 |
| 7.677 | 3.414 |
| 7.6815 | 3.431 |
| 7.686 | 3.431 |
| 7.6905 | 3.45 |
| 7.695 | 3.45 |
| 7.6995 | 3.471 |
| 7.704 | 3.493 |
| 7.7085 | 3.493 |
| 7.713 | 3.514 |
| 7.7175 | 3.514 |
| 7.722 | 3.534 |
| 7.7265 | 3.534 |
| 7.731 | 3.555 |
| 7.7355 | 3.555 |
| 7.74 | 3.575 |
| 7.7445 | 3.595 |
| 7.749 | 3.595 |
| 7.7535 | 3.616 |
| 7.758 | 3.616 |
| 7.7625 | 3.638 |
| 7.767 | 3.638 |
| 7.7715 | 3.66 |
| 7.776 | 3.68 |
| 7.7805 | 3.68 |
| 7.785 | 3.701 |
| 7.7895 | 3.701 |
| 7.794 | 3.72 |
| 7.7985 | 3.72 |
| 7.803 | 3.741 |
| 7.8075 | 3.741 |
| 7.812 | 3.762 |
| 7.8165 | 3.783 |
| 7.821 | 3.783 |
| 7.8255 | 3.804 |
| 7.83 | 3.804 |
| 7.8345 | 3.825 |
| 7.839 | 3.825 |
| 7.8435 | 3.845 |
| 7.848 | 3.845 |
| 7.8525 | 3.866 |
| 7.857 | 3.886 |
| 7.8615 | 3.886 |
| 7.866 | 3.907 |
| 7.8705 | 3.907 |
| 7.875 | 3.928 |
| 7.8795 | 3.928 |
| 7.884 | 3.949 |
| 7.8885 | 3.949 |
| 7.893 | 3.97 |
| 7.8975 | 3.99 |
| 7.902 | 3.99 |
| 7.9065 | 4.01 |
| 7.911 | 4.01 |
| 7.9155 | 4.03 |
| 7.92 | 4.03 |
| 7.9245 | 4.051 |
| 7.929 | 4.071 |
| 7.9335 | 4.071 |
| 7.938 | 4.092 |
| 7.9425 | 4.092 |
| 7.947 | 4.113 |
| 7.9515 | 4.113 |
| 7.956 | 4.133 |
| 7.9605 | 4.133 |
| 7.965 | 4.154 |
| 7.9695 | 4.176 |
| 7.974 | 4.176 |
| 7.9785 | 4.198 |
| 7.983 | 4.198 |
| 7.9875 | 4.221 |
| 7.992 | 4.221 |
| 7.9965 | 4.243 |
| 8.001 | 4.243 |
| 8.0055 | 4.265 |
| 8.01 | 4.286 |
| 8.0145 | 4.286 |
| 8.019 | 4.306 |
| 8.0235 | 4.306 |
| 8.028 | 4.327 |
| 8.0325 | 4.327 |
| 8.037 | 4.347 |
| 8.0415 | 4.347 |
| 8.046 | 4.368 |
| 8.0505 | 4.389 |
| 8.055 | 4.389 |
| 8.0595 | 4.41 |
| 8.064 | 4.41 |
| 8.0685 | 4.43 |
| 8.073 | 4.43 |
| 8.0775 | 4.45 |
| 8.082 | 4.469 |
| 8.0865 | 4.469 |
| 8.091 | 4.489 |
| 8.0955 | 4.489 |
| 8.1 | 4.51 |
| 8.1045 | 4.51 |
| 8.109 | 4.532 |
| 8.1135 | 4.532 |
| 8.118 | 4.555 |
| 8.1225 | 4.579 |
| 8.127 | 4.579 |
| 8.1315 | 4.603 |
| 8.136 | 4.603 |
| 8.1405 | 4.626 |
| 8.145 | 4.626 |
| 8.1495 | 4.648 |
| 8.154 | 4.648 |
| 8.1585 | 4.669 |
| 8.163 | 4.69 |
| 8.1675 | 4.69 |
| 8.172 | 4.711 |
| 8.1765 | 4.711 |
| 8.181 | 4.733 |
| 8.1855 | 4.733 |
| 8.19 | 4.755 |
| 8.1945 | 4.755 |
| 8.199 | 4.777 |
| 8.2035 | 4.799 |
| 8.208 | 4.799 |
| 8.2125 | 4.82 |
| 8.217 | 4.82 |
| 8.2215 | 4.842 |
| 8.226 | 4.842 |
| 8.2305 | 4.866 |
| 8.235 | 4.889 |
| 8.2395 | 4.889 |
| 8.244 | 4.914 |
| 8.2485 | 4.914 |
| 8.253 | 4.938 |
| 8.2575 | 4.938 |
| 8.262 | 4.96 |
| 8.2665 | 4.96 |
| 8.271 | 4.982 |
| 8.2755 | 5.002 |
| 8.28 | 5.002 |
| 8.2845 | 5.022 |
| 8.289 | 5.022 |
| 8.2935 | 5.042 |
| 8.298 | 5.042 |
| 8.3025 | 5.062 |
| 8.307 | 5.062 |
| 8.3115 | 5.084 |
| 8.316 | 5.106 |
| 8.3205 | 5.106 |
| 8.325 | 5.129 |
| 8.3295 | 5.129 |
| 8.334 | 5.151 |
| 8.3385 | 5.151 |
| 8.343 | 5.174 |
| 8.3475 | 5.186 |
| 8.352 | 5.198 |
| 8.3565 | 5.223 |
| 8.361 | 5.223 |
| 8.3655 | 5.247 |
| 8.37 | 5.247 |
| 8.3745 | 5.271 |
| 8.379 | 5.271 |
| 8.3835 | 5.293 |
| 8.388 | 5.314 |
| 8.3925 | 5.314 |
| 8.397 | 5.334 |
| 8.4015 | 5.334 |
| 8.406 | 5.355 |
| 8.4105 | 5.355 |
| 8.415 | 5.377 |
| 8.4195 | 5.377 |
| 8.424 | 5.4 |
| 8.4285 | 5.423 |
| 8.433 | 5.423 |
| 8.4375 | 5.444 |
| 8.442 | 5.444 |
| 8.4465 | 5.464 |
| 8.451 | 5.464 |
| 8.4555 | 5.484 |
| 8.46 | 5.484 |
| 8.4645 | 5.505 |
| 8.469 | 5.528 |
| 8.4735 | 5.528 |
| 8.478 | 5.553 |
| 8.4825 | 5.553 |
| 8.487 | 5.578 |
| 8.4915 | 5.578 |
| 8.496 | 5.603 |
| 8.5005 | 5.626 |
| 8.505 | 5.626 |
| 8.5095 | 5.647 |
| 8.514 | 5.647 |
| 8.5185 | 5.667 |
| 8.523 | 5.667 |
| 8.5275 | 5.688 |
| 8.532 | 5.688 |
| 8.5365 | 5.711 |
| 8.541 | 5.735 |
| 8.5455 | 5.735 |
| 8.55 | 5.759 |
| 8.5545 | 5.759 |
| 8.559 | 5.784 |
| 8.5635 | 5.784 |
| 8.568 | 5.807 |
| 8.5725 | 5.807 |
| 8.577 | 5.829 |
| 8.5815 | 5.851 |
| 8.586 | 5.851 |
| 8.5905 | 5.872 |
| 8.595 | 5.872 |
| 8.5995 | 5.894 |
| 8.604 | 5.894 |
| 8.6085 | 5.916 |
| 8.613 | 5.916 |
| 8.6175 | 5.938 |
| 8.622 | 5.96 |
| 8.6265 | 5.96 |
| 8.631 | 5.981 |
| 8.6355 | 5.981 |
| 8.64 | 6.002 |
| 8.6445 | 6.002 |
| 8.649 | 6.023 |
| 8.6535 | 6.045 |
| 8.658 | 6.045 |
| 8.6625 | 6.067 |
| 8.667 | 6.067 |
| 8.6715 | 6.089 |
| 8.676 | 6.089 |
| 8.6805 | 6.112 |
| 8.685 | 6.112 |
| 8.6895 | 6.135 |
| 8.694 | 6.158 |
| 8.6985 | 6.158 |
| 8.703 | 6.18 |
| 8.7075 | 6.18 |
| 8.712 | 6.202 |
| 8.7165 | 6.202 |
| 8.721 | 6.224 |
| 8.7255 | 6.224 |
| 8.73 | 6.246 |
| 8.7345 | 6.268 |
| 8.739 | 6.268 |
| 8.7435 | 6.291 |
| 8.748 | 6.291 |
| 8.7525 | 6.315 |
| 8.757 | 6.315 |
| 8.7615 | 6.338 |
| 8.766 | 6.338 |
| 8.7705 | 6.362 |
| 8.775 | 6.387 |
| 8.7795 | 6.387 |
| 8.784 | 6.411 |
| 8.7885 | 6.411 |
| 8.793 | 6.435 |
| 8.7975 | 6.435 |
| 8.802 | 6.458 |
| 8.8065 | 6.481 |
| 8.811 | 6.481 |
| 8.8155 | 6.503 |
| 8.82 | 6.503 |
| 8.8245 | 6.525 |
| 8.829 | 6.525 |
| 8.8335 | 6.547 |
| 8.838 | 6.547 |
| 8.8425 | 6.569 |
| 8.847 | 6.591 |
| 8.8515 | 6.591 |
| 8.856 | 6.613 |
| 8.8605 | 6.613 |
| 8.865 | 6.634 |
| 8.8695 | 6.634 |
| 8.874 | 6.654 |
| 8.8785 | 6.654 |
| 8.883 | 6.675 |
| 8.8875 | 6.696 |
| 8.892 | 6.696 |
| 8.8965 | 6.718 |
| 8.901 | 6.718 |
| 8.9055 | 6.741 |
| 8.91 | 6.741 |
| 8.9145 | 6.764 |
| 8.919 | 6.764 |
| 8.9235 | 6.785 |
| 8.928 | 6.806 |
| 8.9325 | 6.806 |
| 8.937 | 6.826 |
| 8.9415 | 6.826 |
| 8.946 | 6.846 |
| 8.9505 | 6.846 |
| 8.955 | 6.866 |
| 8.9595 | 6.887 |
| 8.964 | 6.887 |
| 8.9685 | 6.908 |
| 8.973 | 6.908 |
| 8.9775 | 6.931 |
| 8.982 | 6.931 |
| 8.9865 | 6.954 |
| 8.991 | 6.954 |
| 8.9955 | 6.978 |
| 9.0 | 7.002 |
| 9.0045 | 7.002 |
| 9.009 | 7.026 |
| 9.0135 | 7.026 |
| 9.018 | 7.05 |
| 9.0225 | 7.05 |
| 9.027 | 7.074 |
| 9.0315 | 7.074 |
| 9.036 | 7.096 |
| 9.0405 | 7.118 |
| 9.045 | 7.118 |
| 9.0495 | 7.139 |
| 9.054 | 7.139 |
| 9.0585 | 7.159 |
| 9.063 | 7.159 |
| 9.0675 | 7.18 |
| 9.072 | 7.201 |
| 9.0765 | 7.201 |
| 9.081 | 7.223 |
| 9.0855 | 7.223 |
| 9.09 | 7.245 |
| 9.0945 | 7.245 |
| 9.099 | 7.268 |
| 9.1035 | 7.268 |
| 9.108 | 7.291 |
| 9.1125 | 7.313 |
| 9.117 | 7.313 |
| 9.1215 | 7.334 |
| 9.126 | 7.334 |
| 9.1305 | 7.356 |
| 9.135 | 7.356 |
| 9.1395 | 7.378 |
| 9.144 | 7.378 |
| 9.1485 | 7.401 |
| 9.153 | 7.424 |
| 9.1575 | 7.424 |
| 9.162 | 7.447 |
| 9.1665 | 7.447 |
| 9.171 | 7.471 |
| 9.1755 | 7.471 |
| 9.18 | 7.494 |
| 9.1845 | 7.494 |
| 9.189 | 7.516 |
| 9.1935 | 7.539 |
| 9.198 | 7.539 |
| 9.2025 | 7.561 |
| 9.207 | 7.561 |
| 9.2115 | 7.583 |
| 9.216 | 7.583 |
| 9.2205 | 7.605 |
| 9.225 | 7.627 |
| 9.2295 | 7.627 |
| 9.234 | 7.648 |
| 9.2385 | 7.648 |
| 9.243 | 7.669 |
| 9.2475 | 7.669 |
| 9.252 | 7.689 |
| 9.2565 | 7.689 |
| 9.261 | 7.71 |
| 9.2655 | 7.731 |
| 9.27 | 7.731 |
| 9.2745 | 7.753 |
| 9.279 | 7.753 |
| 9.2835 | 7.776 |
| 9.288 | 7.776 |
| 9.2925 | 7.799 |
| 9.297 | 7.799 |
| 9.3015 | 7.823 |
| 9.306 | 7.847 |
| 9.3105 | 7.847 |
| 9.315 | 7.871 |
| 9.3195 | 7.871 |
| 9.324 | 7.895 |
| 9.3285 | 7.895 |
| 9.333 | 7.917 |
| 9.3375 | 7.917 |
| 9.342 | 7.939 |
| 9.3465 | 7.959 |
| 9.351 | 7.959 |
| 9.3555 | 7.98 |
| 9.36 | 7.98 |
| 9.3645 | 8.001 |
| 9.369 | 8.001 |
| 9.3735 | 8.022 |
| 9.378 | 8.043 |
| 9.3825 | 8.043 |
| 9.387 | 8.065 |
| 9.3915 | 8.065 |
| 9.396 | 8.087 |
| 9.4005 | 8.087 |
| 9.405 | 8.11 |
| 9.4095 | 8.11 |
| 9.414 | 8.132 |
| 9.4185 | 8.155 |
| 9.423 | 8.155 |
| 9.4275 | 8.178 |
| 9.432 | 8.178 |
| 9.4365 | 8.201 |
| 9.441 | 8.201 |
| 9.4455 | 8.223 |
| 9.45 | 8.223 |
| 9.4545 | 8.247 |
| 9.459 | 8.27 |
| 9.4635 | 8.27 |
| 9.468 | 8.294 |
| 9.4725 | 8.294 |
| 9.477 | 8.319 |
| 9.4815 | 8.319 |
| 9.486 | 8.344 |
| 9.4905 | 8.344 |
| 9.495 | 8.37 |
| 9.4995 | 8.396 |
| 9.504 | 8.396 |
| 9.5085 | 8.421 |
| 9.513 | 8.421 |
| 9.5175 | 8.446 |
| 9.522 | 8.446 |
| 9.5265 | 8.469 |
| 9.531 | 8.492 |
| 9.5355 | 8.492 |
| 9.54 | 8.513 |
| 9.5445 | 8.513 |
| 9.549 | 8.534 |
| 9.5535 | 8.534 |
| 9.558 | 8.554 |
| 9.5625 | 8.554 |
| 9.567 | 8.574 |
| 9.5715 | 8.594 |
| 9.576 | 8.594 |
| 9.5805 | 8.615 |
| 9.585 | 8.615 |
| 9.5895 | 8.637 |
| 9.594 | 8.637 |
| 9.5985 | 8.659 |
| 9.603 | 8.659 |
| 9.6075 | 8.681 |
| 9.612 | 8.704 |
| 9.6165 | 8.704 |
| 9.621 | 8.727 |
| 9.6255 | 8.727 |
| 9.63 | 8.75 |
| 9.6345 | 8.75 |
| 9.639 | 8.774 |
| 9.6435 | 8.786 |
| 9.648 | 8.798 |
| 9.6525 | 8.822 |
| 9.657 | 8.822 |
| 9.6615 | 8.846 |
| 9.666 | 8.846 |
| 9.6705 | 8.87 |
| 9.675 | 8.87 |
| 9.6795 | 8.893 |
| 9.684 | 8.916 |
| 9.6885 | 8.916 |
| 9.693 | 8.94 |
| 9.6975 | 8.94 |
| 9.702 | 8.963 |
| 9.7065 | 8.963 |
| 9.711 | 8.986 |
| 9.7155 | 8.986 |
| 9.72 | 9.009 |
| 9.7245 | 9.032 |
| 9.729 | 9.032 |
| 9.7335 | 9.054 |
| 9.738 | 9.054 |
| 9.7425 | 9.076 |
| 9.747 | 9.076 |
| 9.7515 | 9.097 |
| 9.756 | 9.097 |
| 9.7605 | 9.119 |
| 9.765 | 9.14 |
| 9.7695 | 9.14 |
| 9.774 | 9.162 |
| 9.7785 | 9.162 |
| 9.783 | 9.184 |
| 9.7875 | 9.184 |
| 9.792 | 9.206 |
| 9.7965 | 9.228 |
| 9.801 | 9.228 |
| 9.8055 | 9.25 |
| 9.81 | 9.25 |
| 9.8145 | 9.272 |
| 9.819 | 9.272 |
| 9.8235 | 9.295 |
| 9.828 | 9.295 |
| 9.8325 | 9.319 |
| 9.837 | 9.343 |
| 9.8415 | 9.343 |
| 9.846 | 9.367 |
| 9.8505 | 9.367 |
| 9.855 | 9.391 |
| 9.8595 | 9.391 |
| 9.864 | 9.414 |
| 9.8685 | 9.414 |
| 9.873 | 9.436 |
| 9.8775 | 9.456 |
| 9.882 | 9.456 |
| 9.8865 | 9.475 |
| 9.891 | 9.475 |
| 9.8955 | 9.493 |
| 9.9 | 9.493 |
| 9.9045 | 9.51 |
| 9.909 | 9.51 |
| 9.9135 | 9.527 |
| 9.918 | 9.544 |
| 9.9225 | 9.544 |
| 9.927 | 9.561 |
| 9.9315 | 9.561 |
| 9.936 | 9.577 |
| 9.9405 | 9.577 |
| 9.945 | 9.594 |
| 9.9495 | 9.61 |
| 9.954 | 9.61 |
| 9.9585 | 9.627 |
| 9.963 | 9.627 |
| 9.9675 | 9.644 |
| 9.972 | 9.644 |
| 9.9765 | 9.661 |
| 9.981 | 9.661 |
| 9.9855 | 9.679 |
| 9.99 | 9.697 |
| 9.9945 | 9.697 |
| 9.999 | 9.716 |
| 10.0035 | 9.716 |
| 10.008 | 9.735 |
| 10.0125 | 9.735 |
| 10.017 | 9.755 |
| 10.0215 | 9.755 |
| 10.026 | 9.776 |
| 10.0305 | 9.797 |
| 10.035 | 9.797 |
| 10.0395 | 9.819 |
| 10.044 | 9.819 |
| 10.0485 | 9.842 |
| 10.053 | 9.842 |
| 10.0575 | 9.866 |
| 10.062 | 9.866 |
| 10.0665 | 9.89 |
| 10.071 | 9.915 |
| 10.0755 | 9.915 |
| 10.08 | 9.94 |
| 10.0845 | 9.94 |
| 10.089 | 9.965 |
| 10.0935 | 9.965 |
| 10.098 | 9.989 |
| 10.1025 | 10.013 |
| 10.107 | 10.013 |
| 10.1115 | 10.036 |
| 10.116 | 10.036 |
| 10.1205 | 10.058 |
| 10.125 | 10.058 |
| 10.1295 | 10.078 |
| 10.134 | 10.078 |
| 10.1385 | 10.098 |
| 10.143 | 10.118 |
| 10.1475 | 10.118 |
| 10.152 | 10.138 |
| 10.1565 | 10.138 |
| 10.161 | 10.157 |
| 10.1655 | 10.157 |
| 10.17 | 10.178 |
| 10.1745 | 10.178 |
| 10.179 | 10.199 |
| 10.1835 | 10.22 |
| 10.188 | 10.22 |
| 10.1925 | 10.243 |
| 10.197 | 10.243 |
| 10.2015 | 10.265 |
| 10.206 | 10.265 |
| 10.2105 | 10.287 |
| 10.215 | 10.298 |
| 10.2195 | 10.31 |
| 10.224 | 10.332 |
| 10.2285 | 10.332 |
| 10.233 | 10.354 |
| 10.2375 | 10.354 |
| 10.242 | 10.377 |
| 10.2465 | 10.377 |
| 10.251 | 10.4 |
| 10.2555 | 10.423 |
| 10.26 | 10.423 |
| 10.2645 | 10.446 |
| 10.269 | 10.446 |
| 10.2735 | 10.469 |
| 10.278 | 10.469 |
| 10.2825 | 10.492 |
| 10.287 | 10.492 |
| 10.2915 | 10.515 |
| 10.296 | 10.536 |
| 10.3005 | 10.536 |
| 10.305 | 10.557 |
| 10.3095 | 10.557 |
| 10.314 | 10.578 |
| 10.3185 | 10.578 |
| 10.323 | 10.598 |
| 10.3275 | 10.598 |
| 10.332 | 10.618 |
| 10.3365 | 10.638 |
| 10.341 | 10.638 |
| 10.3455 | 10.658 |
| 10.35 | 10.658 |
| 10.3545 | 10.678 |
| 10.359 | 10.678 |
| 10.3635 | 10.698 |
| 10.368 | 10.709 |
| 10.3725 | 10.719 |
| 10.377 | 10.74 |
| 10.3815 | 10.74 |
| 10.386 | 10.762 |
| 10.3905 | 10.762 |
| 10.395 | 10.784 |
| 10.3995 | 10.784 |
| 10.404 | 10.808 |
| 10.4085 | 10.831 |
| 10.413 | 10.831 |
| 10.4175 | 10.855 |
| 10.422 | 10.855 |
| 10.4265 | 10.879 |
| 10.431 | 10.879 |
| 10.4355 | 10.902 |
| 10.44 | 10.902 |
| 10.4445 | 10.926 |
| 10.449 | 10.949 |
| 10.4535 | 10.949 |
| 10.458 | 10.971 |
| 10.4625 | 10.971 |
| 10.467 | 10.993 |
| 10.4715 | 10.993 |
| 10.476 | 11.015 |
| 10.4805 | 11.015 |
| 10.485 | 11.037 |
| 10.4895 | 11.059 |
| 10.494 | 11.059 |
| 10.4985 | 11.081 |
| 10.503 | 11.081 |
| 10.5075 | 11.102 |
| 10.512 | 11.102 |
| 10.5165 | 11.123 |
| 10.521 | 11.143 |
| 10.5255 | 11.143 |
| 10.53 | 11.163 |
| 10.5345 | 11.163 |
| 10.539 | 11.182 |
| 10.5435 | 11.182 |
| 10.548 | 11.2 |
| 10.5525 | 11.2 |
| 10.557 | 11.219 |
| 10.5615 | 11.237 |
| 10.566 | 11.237 |
| 10.5705 | 11.256 |
| 10.575 | 11.256 |
| 10.5795 | 11.274 |
| 10.584 | 11.274 |
| 10.5885 | 11.293 |
| 10.593 | 11.293 |
| 10.5975 | 11.312 |
| 10.602 | 11.33 |
| 10.6065 | 11.33 |
| 10.611 | 11.348 |
| 10.6155 | 11.348 |
| 10.62 | 11.365 |
| 10.6245 | 11.365 |
| 10.629 | 11.383 |
| 10.6335 | 11.383 |
| 10.638 | 11.4 |
| 10.6425 | 11.417 |
| 10.647 | 11.417 |
| 10.6515 | 11.436 |
| 10.656 | 11.436 |
| 10.6605 | 11.456 |
| 10.665 | 11.456 |
| 10.6695 | 11.476 |
| 10.674 | 11.498 |
| 10.6785 | 11.498 |
| 10.683 | 11.521 |
| 10.6875 | 11.521 |
| 10.692 | 11.544 |
| 10.6965 | 11.544 |
| 10.701 | 11.567 |
| 10.7055 | 11.567 |
| 10.71 | 11.59 |
| 10.7145 | 11.614 |
| 10.719 | 11.614 |
| 10.7235 | 11.637 |
| 10.728 | 11.637 |
| 10.7325 | 11.66 |
| 10.737 | 11.66 |
| 10.7415 | 11.683 |
| 10.746 | 11.683 |
| 10.7505 | 11.705 |
| 10.755 | 11.726 |
| 10.7595 | 11.726 |
| 10.764 | 11.747 |
| 10.7685 | 11.747 |
| 10.773 | 11.767 |
| 10.7775 | 11.767 |
| 10.782 | 11.786 |
| 10.7865 | 11.786 |
| 10.791 | 11.805 |
| 10.7955 | 11.825 |
| 10.8 | 11.825 |
| 10.8045 | 11.844 |
| 10.809 | 11.844 |
| 10.8135 | 11.865 |
| 10.818 | 11.865 |
| 10.8225 | 11.885 |
| 10.827 | 11.905 |
| 10.8315 | 11.905 |
| 10.836 | 11.925 |
| 10.8405 | 11.925 |
| 10.845 | 11.945 |
| 10.8495 | 11.945 |
| 10.854 | 11.963 |
| 10.8585 | 11.963 |
| 10.863 | 11.98 |
| 10.8675 | 11.997 |
| 10.872 | 11.997 |
| 10.8765 | 12.013 |
| 10.881 | 12.013 |
| 10.8855 | 12.028 |
| 10.89 | 12.028 |
| 10.8945 | 12.044 |
| 10.899 | 12.044 |
| 10.9035 | 12.06 |
| 10.908 | 12.076 |
| 10.9125 | 12.076 |
| 10.917 | 12.093 |
| 10.9215 | 12.093 |
| 10.926 | 12.11 |
| 10.9305 | 12.11 |
| 10.935 | 12.128 |
| 10.9395 | 12.136 |
| 10.944 | 12.146 |
| 10.9485 | 12.165 |
| 10.953 | 12.165 |
| 10.9575 | 12.184 |
| 10.962 | 12.184 |
| 10.9665 | 12.203 |
| 10.971 | 12.203 |
| 10.9755 | 12.222 |
| 10.98 | 12.242 |
| 10.9845 | 12.242 |
| 10.989 | 12.261 |
| 10.9935 | 12.261 |
| 10.998 | 12.28 |
| 11.0025 | 12.28 |
| 11.007 | 12.299 |
| 11.0115 | 12.299 |
| 11.016 | 12.318 |
| 11.0205 | 12.337 |
| 11.025 | 12.337 |
| 11.0295 | 12.356 |
| 11.034 | 12.356 |
| 11.0385 | 12.375 |
| 11.043 | 12.375 |
| 11.0475 | 12.394 |
| 11.052 | 12.394 |
| 11.0565 | 12.412 |
| 11.061 | 12.431 |
| 11.0655 | 12.431 |
| 11.07 | 12.45 |
| 11.0745 | 12.45 |
| 11.079 | 12.468 |
| 11.0835 | 12.468 |
| 11.088 | 12.487 |
| 11.0925 | 12.506 |
| 11.097 | 12.506 |
| 11.1015 | 12.524 |
| 11.106 | 12.524 |
| 11.1105 | 12.543 |
| 11.115 | 12.543 |
| 11.1195 | 12.562 |
| 11.124 | 12.562 |
| 11.1285 | 12.58 |
| 11.133 | 12.599 |
| 11.1375 | 12.599 |
| 11.142 | 12.617 |
| 11.1465 | 12.617 |
| 11.151 | 12.635 |
| 11.1555 | 12.635 |
| 11.16 | 12.654 |
| 11.1645 | 12.654 |
| 11.169 | 12.672 |
| 11.1735 | 12.691 |
| 11.178 | 12.691 |
| 11.1825 | 12.711 |
| 11.187 | 12.711 |
| 11.1915 | 12.73 |
| 11.196 | 12.73 |
| 11.2005 | 12.75 |
| 11.205 | 12.75 |
| 11.2095 | 12.769 |
| 11.214 | 12.788 |
| 11.2185 | 12.788 |
| 11.223 | 12.807 |
| 11.2275 | 12.807 |
| 11.232 | 12.824 |
| 11.2365 | 12.824 |
| 11.241 | 12.841 |
| 11.2455 | 12.858 |
| 11.25 | 12.858 |
| 11.2545 | 12.874 |
| 11.259 | 12.874 |
| 11.2635 | 12.89 |
| 11.268 | 12.89 |
| 11.2725 | 12.906 |
| 11.277 | 12.906 |
| 11.2815 | 12.922 |
| 11.286 | 12.937 |
| 11.2905 | 12.937 |
| 11.295 | 12.953 |
| 11.2995 | 12.953 |
| 11.304 | 12.968 |
| 11.3085 | 12.968 |
| 11.313 | 12.983 |
| 11.3175 | 12.983 |
| 11.322 | 12.998 |
| 11.3265 | 13.014 |
| 11.331 | 13.014 |
| 11.3355 | 13.029 |
| 11.34 | 13.029 |
| 11.3445 | 13.045 |
| 11.349 | 13.045 |
| 11.3535 | 13.061 |
| 11.358 | 13.061 |
| 11.3625 | 13.079 |
| 11.367 | 13.096 |
| 11.3715 | 13.096 |
| 11.376 | 13.115 |
| 11.3805 | 13.115 |
| 11.385 | 13.134 |
| 11.3895 | 13.134 |
| 11.394 | 13.152 |
| 11.3985 | 13.17 |
| 11.403 | 13.17 |
| 11.4075 | 13.188 |
| 11.412 | 13.188 |
| 11.4165 | 13.205 |
| 11.421 | 13.205 |
| 11.4255 | 13.222 |
| 11.43 | 13.222 |
| 11.4345 | 13.238 |
| 11.439 | 13.253 |
| 11.4435 | 13.253 |
| 11.448 | 13.269 |
| 11.4525 | 13.269 |
| 11.457 | 13.285 |
| 11.4615 | 13.285 |
| 11.466 | 13.301 |
| 11.4705 | 13.301 |
| 11.475 | 13.317 |
| 11.4795 | 13.334 |
| 11.484 | 13.334 |
| 11.4885 | 13.35 |
| 11.493 | 13.35 |
| 11.4975 | 13.366 |
| 11.502 | 13.366 |
| 11.5065 | 13.381 |
| 11.511 | 13.389 |
| 11.5155 | 13.397 |
| 11.52 | 13.412 |
| 11.5245 | 13.412 |
| 11.529 | 13.428 |
| 11.5335 | 13.428 |
| 11.538 | 13.443 |
| 11.5425 | 13.443 |
| 11.547 | 13.459 |
| 11.5515 | 13.475 |
| 11.556 | 13.475 |
| 11.5605 | 13.491 |
| 11.565 | 13.491 |
| 11.5695 | 13.508 |
| 11.574 | 13.508 |
| 11.5785 | 13.525 |
| 11.583 | 13.525 |
| 11.5875 | 13.543 |
| 11.592 | 13.561 |
| 11.5965 | 13.561 |
| 11.601 | 13.579 |
| 11.6055 | 13.579 |
| 11.61 | 13.597 |
| 11.6145 | 13.597 |
| 11.619 | 13.616 |
| 11.6235 | 13.616 |
| 11.628 | 13.634 |
| 11.6325 | 13.653 |
| 11.637 | 13.653 |
| 11.6415 | 13.671 |
| 11.646 | 13.671 |
| 11.6505 | 13.69 |
| 11.655 | 13.69 |
| 11.6595 | 13.707 |
| 11.664 | 13.716 |
| 11.6685 | 13.724 |
| 11.673 | 13.742 |
| 11.6775 | 13.742 |
| 11.682 | 13.757 |
| 11.6865 | 13.757 |
| 11.691 | 13.771 |
| 11.6955 | 13.771 |
| 11.7 | 13.785 |
| 11.7045 | 13.797 |
| 11.709 | 13.797 |
| 11.7135 | 13.808 |
| 11.718 | 13.808 |
| 11.7225 | 13.818 |
| 11.727 | 13.818 |
| 11.7315 | 13.829 |
| 11.736 | 13.829 |
| 11.7405 | 13.839 |
| 11.745 | 13.849 |
| 11.7495 | 13.849 |
| 11.754 | 13.859 |
| 11.7585 | 13.859 |
| 11.763 | 13.872 |
| 11.7675 | 13.872 |
| 11.772 | 13.886 |
| 11.7765 | 13.886 |
| 11.781 | 13.9 |
| 11.7855 | 13.917 |
| 11.79 | 13.917 |
| 11.7945 | 13.936 |
| 11.799 | 13.936 |
| 11.8035 | 13.955 |
| 11.808 | 13.955 |
| 11.8125 | 13.974 |
| 11.817 | 13.994 |
| 11.8215 | 13.994 |
| 11.826 | 14.013 |
| 11.8305 | 14.013 |
| 11.835 | 14.033 |
| 11.8395 | 14.033 |
| 11.844 | 14.051 |
| 11.8485 | 14.051 |
| 11.853 | 14.068 |
| 11.8575 | 14.085 |
| 11.862 | 14.085 |
| 11.8665 | 14.101 |
| 11.871 | 14.101 |
| 11.8755 | 14.117 |
| 11.88 | 14.117 |
| 11.8845 | 14.132 |
| 11.889 | 14.132 |
| 11.8935 | 14.148 |
| 11.898 | 14.165 |
| 11.9025 | 14.165 |
| 11.907 | 14.182 |
| 11.9115 | 14.182 |
| 11.916 | 14.199 |
| 11.9205 | 14.199 |
| 11.925 | 14.217 |
| 11.9295 | 14.217 |
| 11.934 | 14.236 |
| 11.9385 | 14.254 |
| 11.943 | 14.254 |
| 11.9475 | 14.272 |
| 11.952 | 14.272 |
| 11.9565 | 14.289 |
| 11.961 | 14.289 |
| 11.9655 | 14.305 |
| 11.97 | 14.321 |
| 11.9745 | 14.321 |
| 11.979 | 14.335 |
| 11.9835 | 14.335 |
| 11.988 | 14.349 |
| 11.9925 | 14.349 |
| 11.997 | 14.362 |
| 12.0015 | 14.362 |
| 12.006 | 14.375 |
| 12.0105 | 14.388 |
| 12.015 | 14.388 |
| 12.0195 | 14.401 |
| 12.024 | 14.401 |
| 12.0285 | 14.414 |
| 12.033 | 14.414 |
| 12.0375 | 14.429 |
| 12.042 | 14.429 |
| 12.0465 | 14.444 |
| 12.051 | 14.46 |
| 12.0555 | 14.46 |
| 12.06 | 14.476 |
| 12.0645 | 14.476 |
| 12.069 | 14.494 |
| 12.0735 | 14.494 |
| 12.078 | 14.512 |
| 12.0825 | 14.521 |
| 12.087 | 14.53 |
| 12.0915 | 14.549 |
| 12.096 | 14.549 |
| 12.1005 | 14.568 |
| 12.105 | 14.568 |
| 12.1095 | 14.586 |
| 12.114 | 14.586 |
| 12.1185 | 14.605 |
| 12.123 | 14.622 |
| 12.1275 | 14.622 |
| 12.132 | 14.64 |
| 12.1365 | 14.64 |
| 12.141 | 14.657 |
| 12.1455 | 14.657 |
| 12.15 | 14.673 |
| 12.1545 | 14.673 |
| 12.159 | 14.688 |
| 12.1635 | 14.703 |
| 12.168 | 14.703 |
| 12.1725 | 14.717 |
| 12.177 | 14.717 |
| 12.1815 | 14.73 |
| 12.186 | 14.73 |
| 12.1905 | 14.742 |
| 12.195 | 14.742 |
| 12.1995 | 14.755 |
| 12.204 | 14.768 |
| 12.2085 | 14.768 |
| 12.213 | 14.78 |
| 12.2175 | 14.78 |
| 12.222 | 14.793 |
| 12.2265 | 14.793 |
| 12.231 | 14.806 |
| 12.2355 | 14.813 |
| 12.24 | 14.82 |
| 12.2445 | 14.834 |
| 12.249 | 14.834 |
| 12.2535 | 14.849 |
| 12.258 | 14.849 |
| 12.2625 | 14.863 |
| 12.267 | 14.863 |
| 12.2715 | 14.878 |
| 12.276 | 14.894 |
| 12.2805 | 14.894 |
| 12.285 | 14.909 |
| 12.2895 | 14.909 |
| 12.294 | 14.924 |
| 12.2985 | 14.924 |
| 12.303 | 14.94 |
| 12.3075 | 14.94 |
| 12.312 | 14.956 |
| 12.3165 | 14.971 |
| 12.321 | 14.971 |
| 12.3255 | 14.987 |
| 12.33 | 14.987 |
| 12.3345 | 15.004 |
| 12.339 | 15.004 |
| 12.3435 | 15.02 |
| 12.348 | 15.02 |
| 12.3525 | 15.036 |
| 12.357 | 15.053 |
| 12.3615 | 15.053 |
| 12.366 | 15.07 |
| 12.3705 | 15.07 |
| 12.375 | 15.087 |
| 12.3795 | 15.087 |
| 12.384 | 15.103 |
| 12.3885 | 15.119 |
| 12.393 | 15.119 |
| 12.3975 | 15.135 |
| 12.402 | 15.135 |
| 12.4065 | 15.151 |
| 12.411 | 15.151 |
| 12.4155 | 15.165 |
| 12.42 | 15.165 |
| 12.4245 | 15.179 |
| 12.429 | 15.193 |
| 12.4335 | 15.193 |
| 12.438 | 15.206 |
| 12.4425 | 15.206 |
| 12.447 | 15.219 |
| 12.4515 | 15.219 |
| 12.456 | 15.231 |
| 12.4605 | 15.231 |
| 12.465 | 15.244 |
| 12.4695 | 15.258 |
| 12.474 | 15.258 |
| 12.4785 | 15.272 |
| 12.483 | 15.272 |
| 12.4875 | 15.285 |
| 12.492 | 15.285 |
| 12.4965 | 15.3 |
| 12.501 | 15.3 |
| 12.5055 | 15.316 |
| 12.51 | 15.332 |
| 12.5145 | 15.332 |
| 12.519 | 15.348 |
| 12.5235 | 15.348 |
| 12.528 | 15.365 |
| 12.5325 | 15.365 |
| 12.537 | 15.383 |
| 12.5415 | 15.401 |
| 12.546 | 15.401 |
| 12.5505 | 15.418 |
| 12.555 | 15.418 |
| 12.5595 | 15.435 |
| 12.564 | 15.435 |
| 12.5685 | 15.452 |
| 12.573 | 15.452 |
| 12.5775 | 15.469 |
| 12.582 | 15.485 |
| 12.5865 | 15.485 |
| 12.591 | 15.5 |
| 12.5955 | 15.5 |
| 12.6 | 15.514 |
| 12.6045 | 15.514 |
| 12.609 | 15.528 |
| 12.6135 | 15.528 |
| 12.618 | 15.541 |
| 12.6225 | 15.554 |
| 12.627 | 15.554 |
| 12.6315 | 15.567 |
| 12.636 | 15.567 |
| 12.6405 | 15.58 |
| 12.645 | 15.58 |
| 12.6495 | 15.594 |
| 12.654 | 15.594 |
| 12.6585 | 15.608 |
| 12.663 | 15.622 |
| 12.6675 | 15.622 |
| 12.672 | 15.635 |
| 12.6765 | 15.635 |
| 12.681 | 15.649 |
| 12.6855 | 15.649 |
| 12.69 | 15.664 |
| 12.6945 | 15.678 |
| 12.699 | 15.678 |
| 12.7035 | 15.692 |
| 12.708 | 15.692 |
| 12.7125 | 15.705 |
| 12.717 | 15.705 |
| 12.7215 | 15.719 |
| 12.726 | 15.719 |
| 12.7305 | 15.732 |
| 12.735 | 15.745 |
| 12.7395 | 15.745 |
| 12.744 | 15.759 |
| 12.7485 | 15.759 |
| 12.753 | 15.772 |
| 12.7575 | 15.772 |
| 12.762 | 15.786 |
| 12.7665 | 15.786 |
| 12.771 | 15.8 |
| 12.7755 | 15.815 |
| 12.78 | 15.815 |
| 12.7845 | 15.831 |
| 12.789 | 15.831 |
| 12.7935 | 15.847 |
| 12.798 | 15.847 |
| 12.8025 | 15.863 |
| 12.807 | 15.871 |
| 12.8115 | 15.88 |
| 12.816 | 15.897 |
| 12.8205 | 15.897 |
| 12.825 | 15.915 |
| 12.8295 | 15.915 |
| 12.834 | 15.932 |
| 12.8385 | 15.932 |
| 12.843 | 15.948 |
| 12.8475 | 15.964 |
| 12.852 | 15.964 |
| 12.8565 | 15.979 |
| 12.861 | 15.979 |
| 12.8655 | 15.994 |
| 12.87 | 15.994 |
| 12.8745 | 16.008 |
| 12.879 | 16.008 |
| 12.8835 | 16.021 |
| 12.888 | 16.034 |
| 12.8925 | 16.034 |
| 12.897 | 16.047 |
| 12.9015 | 16.047 |
| 12.906 | 16.059 |
| 12.9105 | 16.059 |
| 12.915 | 16.071 |
| 12.9195 | 16.071 |
| 12.924 | 16.084 |
| 12.9285 | 16.096 |
| 12.933 | 16.096 |
| 12.9375 | 16.109 |
| 12.942 | 16.109 |
| 12.9465 | 16.122 |
| 12.951 | 16.122 |
| 12.9555 | 16.135 |
| 12.96 | 16.142 |
| 12.9645 | 16.148 |
| 12.969 | 16.162 |
| 12.9735 | 16.162 |
| 12.978 | 16.176 |
| 12.9825 | 16.176 |
| 12.987 | 16.19 |
| 12.9915 | 16.19 |
| 12.996 | 16.204 |
| 13.0005 | 16.218 |
| 13.005 | 16.218 |
| 13.0095 | 16.233 |
| 13.014 | 16.233 |
| 13.0185 | 16.248 |
| 13.023 | 16.248 |
| 13.0275 | 16.263 |
| 13.032 | 16.263 |
| 13.0365 | 16.278 |
| 13.041 | 16.293 |
| 13.0455 | 16.293 |
| 13.05 | 16.309 |
| 13.0545 | 16.309 |
| 13.059 | 16.324 |
| 13.0635 | 16.324 |
| 13.068 | 16.338 |
| 13.0725 | 16.338 |
| 13.077 | 16.353 |
| 13.0815 | 16.367 |
| 13.086 | 16.367 |
| 13.0905 | 16.381 |
| 13.095 | 16.381 |
| 13.0995 | 16.395 |
| 13.104 | 16.395 |
| 13.1085 | 16.407 |
| 13.113 | 16.42 |
| 13.1175 | 16.42 |
| 13.122 | 16.433 |
| 13.1265 | 16.433 |
| 13.131 | 16.445 |
| 13.1355 | 16.445 |
| 13.14 | 16.458 |
| 13.1445 | 16.458 |
| 13.149 | 16.47 |
| 13.1535 | 16.482 |
| 13.158 | 16.482 |
| 13.1625 | 16.495 |
| 13.167 | 16.495 |
| 13.1715 | 16.509 |
| 13.176 | 16.509 |
| 13.1805 | 16.523 |
| 13.185 | 16.523 |
| 13.1895 | 16.537 |
| 13.194 | 16.551 |
| 13.1985 | 16.551 |
| 13.203 | 16.566 |
| 13.2075 | 16.566 |
| 13.212 | 16.58 |
| 13.2165 | 16.58 |
| 13.221 | 16.595 |
| 13.2255 | 16.595 |
| 13.23 | 16.609 |
| 13.2345 | 16.623 |
| 13.239 | 16.623 |
| 13.2435 | 16.636 |
| 13.248 | 16.636 |
| 13.2525 | 16.65 |
| 13.257 | 16.65 |
| 13.2615 | 16.663 |
| 13.266 | 16.675 |
| 13.2705 | 16.675 |
| 13.275 | 16.686 |
| 13.2795 | 16.686 |
| 13.284 | 16.698 |
| 13.2885 | 16.698 |
| 13.293 | 16.71 |
| 13.2975 | 16.71 |
| 13.302 | 16.721 |
| 13.3065 | 16.732 |
| 13.311 | 16.732 |
| 13.3155 | 16.743 |
| 13.32 | 16.743 |
| 13.3245 | 16.754 |
| 13.329 | 16.754 |
| 13.3335 | 16.765 |
| 13.338 | 16.765 |
| 13.3425 | 16.776 |
| 13.347 | 16.787 |
| 13.3515 | 16.787 |
| 13.356 | 16.799 |
| 13.3605 | 16.799 |
| 13.365 | 16.81 |
| 13.3695 | 16.81 |
| 13.374 | 16.822 |
| 13.3785 | 16.828 |
| 13.383 | 16.834 |
| 13.3875 | 16.846 |
| 13.392 | 16.846 |
| 13.3965 | 16.857 |
| 13.401 | 16.857 |
| 13.4055 | 16.869 |
| 13.41 | 16.869 |
| 13.4145 | 16.882 |
| 13.419 | 16.894 |
| 13.4235 | 16.894 |
| 13.428 | 16.905 |
| 13.4325 | 16.905 |
| 13.437 | 16.917 |
| 13.4415 | 16.917 |
| 13.446 | 16.928 |
| 13.4505 | 16.928 |
| 13.455 | 16.939 |
| 13.4595 | 16.95 |
| 13.464 | 16.95 |
| 13.4685 | 16.961 |
| 13.473 | 16.961 |
| 13.4775 | 16.971 |
| 13.482 | 16.971 |
| 13.4865 | 16.982 |
| 13.491 | 16.982 |
| 13.4955 | 16.992 |
| 13.5 | 17.003 |
| 13.5045 | 17.003 |
| 13.509 | 17.014 |
| 13.5135 | 17.014 |
| 13.518 | 17.026 |
| 13.5225 | 17.026 |
| 13.527 | 17.037 |
| 13.5315 | 17.043 |
| 13.536 | 17.049 |
| 13.5405 | 17.061 |
| 13.545 | 17.061 |
| 13.5495 | 17.074 |
| 13.554 | 17.074 |
| 13.5585 | 17.088 |
| 13.563 | 17.088 |
| 13.5675 | 17.101 |
| 13.572 | 17.114 |
| 13.5765 | 17.114 |
| 13.581 | 17.128 |
| 13.5855 | 17.128 |
| 13.59 | 17.142 |
| 13.5945 | 17.142 |
| 13.599 | 17.156 |
| 13.6035 | 17.156 |
| 13.608 | 17.17 |
| 13.6125 | 17.183 |
| 13.617 | 17.183 |
| 13.6215 | 17.197 |
| 13.626 | 17.197 |
| 13.6305 | 17.211 |
| 13.635 | 17.211 |
| 13.6395 | 17.224 |
| 13.644 | 17.224 |
| 13.6485 | 17.238 |
| 13.653 | 17.252 |
| 13.6575 | 17.252 |
| 13.662 | 17.266 |
| 13.6665 | 17.266 |
| 13.671 | 17.28 |
| 13.6755 | 17.28 |
| 13.68 | 17.294 |
| 13.6845 | 17.309 |
| 13.689 | 17.309 |
| 13.6935 | 17.324 |
| 13.698 | 17.324 |
| 13.7025 | 17.339 |
| 13.707 | 17.339 |
| 13.7115 | 17.354 |
| 13.716 | 17.354 |
| 13.7205 | 17.369 |
| 13.725 | 17.384 |
| 13.7295 | 17.384 |
| 13.734 | 17.399 |
| 13.7385 | 17.399 |
| 13.743 | 17.414 |
| 13.7475 | 17.414 |
| 13.752 | 17.428 |
| 13.7565 | 17.428 |
| 13.761 | 17.442 |
| 13.7655 | 17.455 |
| 13.77 | 17.455 |
| 13.7745 | 17.469 |
| 13.779 | 17.469 |
| 13.7835 | 17.482 |
| 13.788 | 17.482 |
| 13.7925 | 17.494 |
| 13.797 | 17.494 |
| 13.8015 | 17.506 |
| 13.806 | 17.517 |
| 13.8105 | 17.517 |
| 13.815 | 17.528 |
| 13.8195 | 17.528 |
| 13.824 | 17.538 |
| 13.8285 | 17.538 |
| 13.833 | 17.549 |
| 13.8375 | 17.559 |
| 13.842 | 17.559 |
| 13.8465 | 17.569 |
| 13.851 | 17.569 |
| 13.8555 | 17.578 |
| 13.86 | 17.578 |
| 13.8645 | 17.589 |
| 13.869 | 17.589 |
| 13.8735 | 17.599 |
| 13.878 | 17.61 |
| 13.8825 | 17.61 |
| 13.887 | 17.621 |
| 13.8915 | 17.621 |
| 13.896 | 17.632 |
| 13.9005 | 17.632 |
| 13.905 | 17.643 |
| 13.9095 | 17.643 |
| 13.914 | 17.655 |
| 13.9185 | 17.668 |
| 13.923 | 17.668 |
| 13.9275 | 17.68 |
| 13.932 | 17.68 |
| 13.9365 | 17.692 |
| 13.941 | 17.692 |
| 13.9455 | 17.705 |
| 13.95 | 17.705 |
| 13.9545 | 17.717 |
| 13.959 | 17.73 |
| 13.9635 | 17.73 |
| 13.968 | 17.742 |
| 13.9725 | 17.742 |
| 13.977 | 17.755 |
| 13.9815 | 17.755 |
| 13.986 | 17.766 |
| 13.9905 | 17.778 |
| 13.995 | 17.778 |
| 13.9995 | 17.789 |
| 14.004 | 17.789 |
| 14.0085 | 17.8 |
| 14.013 | 17.8 |
| 14.0175 | 17.811 |
| 14.022 | 17.811 |
| 14.0265 | 17.821 |
| 14.031 | 17.831 |
| 14.0355 | 17.831 |
| 14.04 | 17.84 |
| 14.0445 | 17.84 |
| 14.049 | 17.85 |
| 14.0535 | 17.85 |
| 14.058 | 17.859 |
| 14.0625 | 17.859 |
| 14.067 | 17.868 |
| 14.0715 | 17.877 |
| 14.076 | 17.877 |
| 14.0805 | 17.886 |
| 14.085 | 17.886 |
| 14.0895 | 17.894 |
| 14.094 | 17.894 |
| 14.0985 | 17.903 |
| 14.103 | 17.908 |
| 14.1075 | 17.912 |
| 14.112 | 17.921 |
| 14.1165 | 17.921 |
| 14.121 | 17.93 |
| 14.1255 | 17.93 |
| 14.13 | 17.938 |
| 14.1345 | 17.938 |
| 14.139 | 17.947 |
| 14.1435 | 17.955 |
| 14.148 | 17.955 |
| 14.1525 | 17.963 |
| 14.157 | 17.963 |
| 14.1615 | 17.972 |
| 14.166 | 17.972 |
| 14.1705 | 17.98 |
| 14.175 | 17.98 |
| 14.1795 | 17.988 |
| 14.184 | 17.995 |
| 14.1885 | 17.995 |
| 14.193 | 18.003 |
| 14.1975 | 18.003 |
| 14.202 | 18.011 |
| 14.2065 | 18.011 |
| 14.211 | 18.02 |
| 14.2155 | 18.02 |
| 14.22 | 18.029 |
| 14.2245 | 18.038 |
| 14.229 | 18.038 |
| 14.2335 | 18.048 |
| 14.238 | 18.048 |
| 14.2425 | 18.057 |
| 14.247 | 18.057 |
| 14.2515 | 18.069 |
| 14.256 | 18.076 |
| 14.2605 | 18.082 |
| 14.265 | 18.095 |
| 14.2695 | 18.095 |
| 14.274 | 18.108 |
| 14.2785 | 18.108 |
| 14.283 | 18.121 |
| 14.2875 | 18.121 |
| 14.292 | 18.135 |
| 14.2965 | 18.149 |
| 14.301 | 18.149 |
| 14.3055 | 18.163 |
| 14.31 | 18.163 |
| 14.3145 | 18.178 |
| 14.319 | 18.178 |
| 14.3235 | 18.191 |
| 14.328 | 18.191 |
| 14.3325 | 18.204 |
| 14.337 | 18.216 |
| 14.3415 | 18.216 |
| 14.346 | 18.228 |
| 14.3505 | 18.228 |
| 14.355 | 18.239 |
| 14.3595 | 18.239 |
| 14.364 | 18.25 |
| 14.3685 | 18.25 |
| 14.373 | 18.26 |
| 14.3775 | 18.269 |
| 14.382 | 18.269 |
| 14.3865 | 18.278 |
| 14.391 | 18.278 |
| 14.3955 | 18.287 |
| 14.4 | 18.287 |
| 14.4045 | 18.296 |
| 14.409 | 18.305 |
| 14.4135 | 18.305 |
| 14.418 | 18.314 |
| 14.4225 | 18.314 |
| 14.427 | 18.323 |
| 14.4315 | 18.323 |
| 14.436 | 18.333 |
| 14.4405 | 18.333 |
| 14.445 | 18.343 |
| 14.4495 | 18.354 |
| 14.454 | 18.354 |
| 14.4585 | 18.366 |
| 14.463 | 18.366 |
| 14.4675 | 18.378 |
| 14.472 | 18.378 |
| 14.4765 | 18.39 |
| 14.481 | 18.39 |
| 14.4855 | 18.402 |
| 14.49 | 18.415 |
| 14.4945 | 18.415 |
| 14.499 | 18.428 |
| 14.5035 | 18.428 |
| 14.508 | 18.442 |
| 14.5125 | 18.442 |
| 14.517 | 18.455 |
| 14.5215 | 18.455 |
| 14.526 | 18.468 |
| 14.5305 | 18.481 |
| 14.535 | 18.481 |
| 14.5395 | 18.494 |
| 14.544 | 18.494 |
| 14.5485 | 18.506 |
| 14.553 | 18.506 |
| 14.5575 | 18.519 |
| 14.562 | 18.532 |
| 14.5665 | 18.532 |
| 14.571 | 18.545 |
| 14.5755 | 18.545 |
| 14.58 | 18.557 |
| 14.5845 | 18.557 |
| 14.589 | 18.569 |
| 14.5935 | 18.569 |
| 14.598 | 18.582 |
| 14.6025 | 18.594 |
| 14.607 | 18.594 |
| 14.6115 | 18.607 |
| 14.616 | 18.607 |
| 14.6205 | 18.621 |
| 14.625 | 18.621 |
| 14.6295 | 18.634 |
| 14.634 | 18.634 |
| 14.6385 | 18.647 |
| 14.643 | 18.66 |
| 14.6475 | 18.66 |
| 14.652 | 18.674 |
| 14.6565 | 18.674 |
| 14.661 | 18.687 |
| 14.6655 | 18.687 |
| 14.67 | 18.701 |
| 14.6745 | 18.708 |
| 14.679 | 18.714 |
| 14.6835 | 18.728 |
| 14.688 | 18.728 |
| 14.6925 | 18.741 |
| 14.697 | 18.741 |
| 14.7015 | 18.754 |
| 14.706 | 18.754 |
| 14.7105 | 18.767 |
| 14.715 | 18.78 |
| 14.7195 | 18.78 |
| 14.724 | 18.793 |
| 14.7285 | 18.793 |
| 14.733 | 18.806 |
| 14.7375 | 18.806 |
| 14.742 | 18.818 |
| 14.7465 | 18.818 |
| 14.751 | 18.831 |
| 14.7555 | 18.843 |
| 14.76 | 18.843 |
| 14.7645 | 18.856 |
| 14.769 | 18.856 |
| 14.7735 | 18.868 |
| 14.778 | 18.868 |
| 14.7825 | 18.881 |
| 14.787 | 18.881 |
| 14.7915 | 18.894 |
| 14.796 | 18.907 |
| 14.8005 | 18.907 |
| 14.805 | 18.92 |
| 14.8095 | 18.92 |
| 14.814 | 18.933 |
| 14.8185 | 18.933 |
| 14.823 | 18.946 |
| 14.8275 | 18.953 |
| 14.832 | 18.96 |
| 14.8365 | 18.974 |
| 14.841 | 18.974 |
| 14.8455 | 18.988 |
| 14.85 | 18.988 |
| 14.8545 | 19.002 |
| 14.859 | 19.002 |
| 14.8635 | 19.016 |
| 14.868 | 19.03 |
| 14.8725 | 19.03 |
| 14.877 | 19.044 |
| 14.8815 | 19.044 |
| 14.886 | 19.058 |
| 14.8905 | 19.058 |
| 14.895 | 19.072 |
| 14.8995 | 19.072 |
| 14.904 | 19.086 |
| 14.9085 | 19.099 |
| 14.913 | 19.099 |
| 14.9175 | 19.112 |
| 14.922 | 19.112 |
| 14.9265 | 19.125 |
| 14.931 | 19.125 |
| 14.9355 | 19.139 |
| 14.94 | 19.139 |
| 14.9445 | 19.152 |
| 14.949 | 19.165 |
| 14.9535 | 19.165 |
| 14.958 | 19.178 |
| 14.9625 | 19.178 |
| 14.967 | 19.191 |
| 14.9715 | 19.191 |
| 14.976 | 19.204 |
| 14.9805 | 19.217 |
| 14.985 | 19.217 |
| 14.9895 | 19.23 |
| 14.994 | 19.23 |
| 14.9985 | 19.244 |
| 15.003 | 19.244 |
| 15.0075 | 19.258 |
| 15.012 | 19.258 |
| 15.0165 | 19.271 |
| 15.021 | 19.285 |
| 15.0255 | 19.285 |
| 15.03 | 19.299 |
| 15.0345 | 19.299 |
| 15.039 | 19.313 |
| 15.0435 | 19.313 |
| 15.048 | 19.328 |
| 15.0525 | 19.328 |
| 15.057 | 19.343 |
| 15.0615 | 19.357 |
| 15.066 | 19.357 |
| 15.0705 | 19.372 |
| 15.075 | 19.372 |
| 15.0795 | 19.386 |
| 15.084 | 19.386 |
| 15.0885 | 19.4 |
| 15.093 | 19.4 |
| 15.0975 | 19.415 |
| 15.102 | 19.429 |
| 15.1065 | 19.429 |
| 15.111 | 19.444 |
| 15.1155 | 19.444 |
| 15.12 | 19.458 |
| 15.1245 | 19.458 |
| 15.129 | 19.471 |
| 15.1335 | 19.485 |
| 15.138 | 19.485 |
| 15.1425 | 19.499 |
| 15.147 | 19.499 |
| 15.1515 | 19.512 |
| 15.156 | 19.512 |
| 15.1605 | 19.526 |
| 15.165 | 19.526 |
| 15.1695 | 19.538 |
| 15.174 | 19.551 |
| 15.1785 | 19.551 |
| 15.183 | 19.563 |
| 15.1875 | 19.563 |
| 15.192 | 19.576 |
| 15.1965 | 19.576 |
| 15.201 | 19.588 |
| 15.2055 | 19.588 |
| 15.21 | 19.6 |
| 15.2145 | 19.612 |
| 15.219 | 19.612 |
| 15.2235 | 19.623 |
| 15.228 | 19.623 |
| 15.2325 | 19.634 |
| 15.237 | 19.634 |
| 15.2415 | 19.645 |
| 15.246 | 19.645 |
| 15.2505 | 19.657 |
| 15.255 | 19.668 |
| 15.2595 | 19.668 |
| 15.264 | 19.679 |
| 15.2685 | 19.679 |
| 15.273 | 19.69 |
| 15.2775 | 19.69 |
| 15.282 | 19.702 |
| 15.2865 | 19.713 |
| 15.291 | 19.713 |
| 15.2955 | 19.725 |
| 15.3 | 19.725 |
| 15.3045 | 19.737 |
| 15.309 | 19.737 |
| 15.3135 | 19.75 |
| 15.318 | 19.75 |
| 15.3225 | 19.763 |
| 15.327 | 19.776 |
| 15.3315 | 19.776 |
| 15.336 | 19.789 |
| 15.3405 | 19.789 |
| 15.345 | 19.803 |
| 15.3495 | 19.803 |
| 15.354 | 19.817 |
| 15.3585 | 19.817 |
| 15.363 | 19.832 |
| 15.3675 | 19.846 |
| 15.372 | 19.846 |
| 15.3765 | 19.861 |
| 15.381 | 19.861 |
| 15.3855 | 19.875 |
| 15.39 | 19.875 |
| 15.3945 | 19.89 |
| 15.399 | 19.897 |
| 15.4035 | 19.904 |
| 15.408 | 19.919 |
| 15.4125 | 19.919 |
| 15.417 | 19.934 |
| 15.4215 | 19.934 |
| 15.426 | 19.948 |
| 15.4305 | 19.948 |
| 15.435 | 19.963 |
| 15.4395 | 19.977 |
| 15.444 | 19.977 |
| 15.4485 | 19.991 |
| 15.453 | 19.991 |
| 15.4575 | 20.005 |
| 15.462 | 20.005 |
| 15.4665 | 20.019 |
| 15.471 | 20.019 |
| 15.4755 | 20.033 |
| 15.48 | 20.046 |
| 15.4845 | 20.046 |
| 15.489 | 20.06 |
| 15.4935 | 20.06 |
| 15.498 | 20.073 |
| 15.5025 | 20.073 |
| 15.507 | 20.086 |
| 15.5115 | 20.086 |
| 15.516 | 20.099 |
| 15.5205 | 20.112 |
| 15.525 | 20.112 |
| 15.5295 | 20.124 |
| 15.534 | 20.124 |
| 15.5385 | 20.136 |
| 15.543 | 20.136 |
| 15.5475 | 20.148 |
| 15.552 | 20.154 |
| 15.5565 | 20.16 |
| 15.561 | 20.172 |
| 15.5655 | 20.172 |
| 15.57 | 20.184 |
| 15.5745 | 20.184 |
| 15.579 | 20.196 |
| 15.5835 | 20.196 |
| 15.588 | 20.207 |
| 15.5925 | 20.219 |
| 15.597 | 20.219 |
| 15.6015 | 20.23 |
| 15.606 | 20.23 |
| 15.6105 | 20.242 |
| 15.615 | 20.242 |
| 15.6195 | 20.254 |
| 15.624 | 20.254 |
| 15.6285 | 20.266 |
| 15.633 | 20.279 |
| 15.6375 | 20.279 |
| 15.642 | 20.292 |
| 15.6465 | 20.292 |
| 15.651 | 20.305 |
| 15.6555 | 20.305 |
| 15.66 | 20.318 |
| 15.6645 | 20.318 |
| 15.669 | 20.332 |
| 15.6735 | 20.347 |
| 15.678 | 20.347 |
| 15.6825 | 20.362 |
| 15.687 | 20.362 |
| 15.6915 | 20.377 |
| 15.696 | 20.377 |
| 15.7005 | 20.392 |
| 15.705 | 20.406 |
| 15.7095 | 20.406 |
| 15.714 | 20.421 |
| 15.7185 | 20.421 |
| 15.723 | 20.436 |
| 15.7275 | 20.436 |
| 15.732 | 20.45 |
| 15.7365 | 20.45 |
| 15.741 | 20.465 |
| 15.7455 | 20.48 |
| 15.75 | 20.48 |
| 15.7545 | 20.494 |
| 15.759 | 20.494 |
| 15.7635 | 20.508 |
| 15.768 | 20.508 |
| 15.7725 | 20.52 |
| 15.777 | 20.52 |
| 15.7815 | 20.532 |
| 15.786 | 20.544 |
| 15.7905 | 20.544 |
| 15.795 | 20.556 |
| 15.7995 | 20.556 |
| 15.804 | 20.569 |
| 15.8085 | 20.569 |
| 15.813 | 20.58 |
| 15.8175 | 20.58 |
| 15.822 | 20.59 |
| 15.8265 | 20.601 |
| 15.831 | 20.601 |
| 15.8355 | 20.611 |
| 15.84 | 20.611 |
| 15.8445 | 20.622 |
| 15.849 | 20.622 |
| 15.8535 | 20.632 |
| 15.858 | 20.643 |
| 15.8625 | 20.643 |
| 15.867 | 20.653 |
| 15.8715 | 20.653 |
| 15.876 | 20.663 |
| 15.8805 | 20.663 |
| 15.885 | 20.674 |
| 15.8895 | 20.674 |
| 15.894 | 20.684 |
| 15.8985 | 20.694 |
| 15.903 | 20.694 |
| 15.9075 | 20.705 |
| 15.912 | 20.705 |
| 15.9165 | 20.715 |
| 15.921 | 20.715 |
| 15.9255 | 20.725 |
| 15.93 | 20.725 |
| 15.9345 | 20.736 |
| 15.939 | 20.746 |
| 15.9435 | 20.746 |
| 15.948 | 20.756 |
| 15.9525 | 20.756 |
| 15.957 | 20.767 |
| 15.9615 | 20.767 |
| 15.966 | 20.777 |
| 15.9705 | 20.782 |
| 15.975 | 20.787 |
| 15.9795 | 20.797 |
| 15.984 | 20.797 |
| 15.9885 | 20.807 |
| 15.993 | 20.807 |
| 15.9975 | 20.817 |
| 16.002 | 20.817 |
| 16.0065 | 20.828 |
| 16.011 | 20.839 |
| 16.0155 | 20.839 |
| 16.02 | 20.85 |
| 16.0245 | 20.85 |
| 16.029 | 20.861 |
| 16.0335 | 20.861 |
| 16.038 | 20.872 |
| 16.0425 | 20.872 |
| 16.047 | 20.884 |
| 16.0515 | 20.895 |
| 16.056 | 20.895 |
| 16.0605 | 20.908 |
| 16.065 | 20.908 |
| 16.0695 | 20.921 |
| 16.074 | 20.921 |
| 16.0785 | 20.934 |
| 16.083 | 20.934 |
| 16.0875 | 20.947 |
| 16.092 | 20.96 |
| 16.0965 | 20.96 |
| 16.101 | 20.973 |
| 16.1055 | 20.973 |
| 16.11 | 20.986 |
| 16.1145 | 20.986 |
| 16.119 | 20.999 |
| 16.1235 | 21.006 |
| 16.128 | 21.013 |
| 16.1325 | 21.026 |
| 16.137 | 21.026 |
| 16.1415 | 21.04 |
| 16.146 | 21.04 |
| 16.1505 | 21.053 |
| 16.155 | 21.053 |
| 16.1595 | 21.065 |
| 16.164 | 21.078 |
| 16.1685 | 21.078 |
| 16.173 | 21.09 |
| 16.1775 | 21.09 |
| 16.182 | 21.102 |
| 16.1865 | 21.102 |
| 16.191 | 21.114 |
| 16.1955 | 21.114 |
| 16.2 | 21.126 |
| 16.2045 | 21.138 |
| 16.209 | 21.138 |
| 16.2135 | 21.149 |
| 16.218 | 21.149 |
| 16.2225 | 21.16 |
| 16.227 | 21.16 |
| 16.2315 | 21.172 |
| 16.236 | 21.172 |
| 16.2405 | 21.183 |
| 16.245 | 21.195 |
| 16.2495 | 21.195 |
| 16.254 | 21.206 |
| 16.2585 | 21.206 |
| 16.263 | 21.219 |
| 16.2675 | 21.219 |
| 16.272 | 21.231 |
| 16.2765 | 21.244 |
| 16.281 | 21.244 |
| 16.2855 | 21.256 |
| 16.29 | 21.256 |
| 16.2945 | 21.269 |
| 16.299 | 21.269 |
| 16.3035 | 21.282 |
| 16.308 | 21.282 |
| 16.3125 | 21.296 |
| 16.317 | 21.311 |
| 16.3215 | 21.311 |
| 16.326 | 21.326 |
| 16.3305 | 21.326 |
| 16.335 | 21.341 |
| 16.3395 | 21.341 |
| 16.344 | 21.356 |
| 16.3485 | 21.356 |
| 16.353 | 21.371 |
| 16.3575 | 21.387 |
| 16.362 | 21.387 |
| 16.3665 | 21.404 |
| 16.371 | 21.404 |
| 16.3755 | 21.421 |
| 16.38 | 21.421 |
| 16.3845 | 21.438 |
| 16.389 | 21.438 |
| 16.3935 | 21.455 |
| 16.398 | 21.472 |
| 16.4025 | 21.472 |
| 16.407 | 21.489 |
| 16.4115 | 21.489 |
| 16.416 | 21.506 |
| 16.4205 | 21.506 |
| 16.425 | 21.523 |
| 16.4295 | 21.541 |
| 16.434 | 21.541 |
| 16.4385 | 21.558 |
| 16.443 | 21.558 |
| 16.4475 | 21.575 |
| 16.452 | 21.575 |
| 16.4565 | 21.593 |
| 16.461 | 21.593 |
| 16.4655 | 21.61 |
| 16.47 | 21.627 |
| 16.4745 | 21.627 |
| 16.479 | 21.644 |
| 16.4835 | 21.644 |
| 16.488 | 21.661 |
| 16.4925 | 21.661 |
| 16.497 | 21.678 |
| 16.5015 | 21.678 |
| 16.506 | 21.695 |
| 16.5105 | 21.712 |
| 16.515 | 21.712 |
| 16.5195 | 21.73 |
| 16.524 | 21.73 |
| 16.5285 | 21.748 |
| 16.533 | 21.748 |
| 16.5375 | 21.765 |
| 16.542 | 21.765 |
| 16.5465 | 21.783 |
| 16.551 | 21.801 |
| 16.5555 | 21.801 |
| 16.56 | 21.818 |
| 16.5645 | 21.818 |
| 16.569 | 21.837 |
| 16.5735 | 21.837 |
| 16.578 | 21.856 |
| 16.5825 | 21.875 |
| 16.587 | 21.875 |
| 16.5915 | 21.894 |
| 16.596 | 21.894 |
| 16.6005 | 21.914 |
| 16.605 | 21.914 |
| 16.6095 | 21.933 |
| 16.614 | 21.933 |
| 16.6185 | 21.952 |
| 16.623 | 21.973 |
| 16.6275 | 21.973 |
| 16.632 | 21.994 |
| 16.6365 | 21.994 |
| 16.641 | 22.015 |
| 16.6455 | 22.015 |
| 16.65 | 22.036 |
| 16.6545 | 22.036 |
| 16.659 | 22.057 |
| 16.6635 | 22.078 |
| 16.668 | 22.078 |
| 16.6725 | 22.099 |
| 16.677 | 22.099 |
| 16.6815 | 22.121 |
| 16.686 | 22.121 |
| 16.6905 | 22.143 |
| 16.695 | 22.154 |
| 16.6995 | 22.165 |
| 16.704 | 22.187 |
| 16.7085 | 22.187 |
| 16.713 | 22.209 |
| 16.7175 | 22.209 |
| 16.722 | 22.231 |
| 16.7265 | 22.231 |
| 16.731 | 22.253 |
| 16.7355 | 22.276 |
| 16.74 | 22.276 |
| 16.7445 | 22.299 |
| 16.749 | 22.299 |
| 16.7535 | 22.322 |
| 16.758 | 22.322 |
| 16.7625 | 22.345 |
| 16.767 | 22.345 |
| 16.7715 | 22.368 |
| 16.776 | 22.39 |
| 16.7805 | 22.39 |
| 16.785 | 22.414 |
| 16.7895 | 22.414 |
| 16.794 | 22.437 |
| 16.7985 | 22.437 |
| 16.803 | 22.461 |
| 16.8075 | 22.461 |
| 16.812 | 22.485 |
| 16.8165 | 22.508 |
| 16.821 | 22.508 |
| 16.8255 | 22.532 |
| 16.83 | 22.532 |
| 16.8345 | 22.555 |
| 16.839 | 22.555 |
| 16.8435 | 22.579 |
| 16.848 | 22.602 |
| 16.8525 | 22.602 |
| 16.857 | 22.626 |
| 16.8615 | 22.626 |
| 16.866 | 22.649 |
| 16.8705 | 22.649 |
| 16.875 | 22.672 |
| 16.8795 | 22.672 |
| 16.884 | 22.696 |
| 16.8885 | 22.719 |
| 16.893 | 22.719 |
| 16.8975 | 22.741 |
| 16.902 | 22.741 |
| 16.9065 | 22.763 |
| 16.911 | 22.763 |
| 16.9155 | 22.785 |
| 16.92 | 22.785 |
| 16.9245 | 22.807 |
| 16.929 | 22.829 |
| 16.9335 | 22.829 |
| 16.938 | 22.851 |
| 16.9425 | 22.851 |
| 16.947 | 22.873 |
| 16.9515 | 22.873 |
| 16.956 | 22.894 |
| 16.9605 | 22.894 |
| 16.965 | 22.916 |
| 16.9695 | 22.937 |
| 16.974 | 22.937 |
| 16.9785 | 22.959 |
| 16.983 | 22.959 |
| 16.9875 | 22.98 |
| 16.992 | 22.98 |
| 16.9965 | 23.001 |
| 17.001 | 23.023 |
| 17.0055 | 23.023 |
| 17.01 | 23.046 |
| 17.0145 | 23.046 |
| 17.019 | 23.069 |
| 17.0235 | 23.069 |
| 17.028 | 23.092 |
| 17.0325 | 23.092 |
| 17.037 | 23.114 |
| 17.0415 | 23.137 |
| 17.046 | 23.137 |
| 17.0505 | 23.16 |
| 17.055 | 23.16 |
| 17.0595 | 23.182 |
| 17.064 | 23.182 |
| 17.0685 | 23.205 |
| 17.073 | 23.205 |
| 17.0775 | 23.229 |
| 17.082 | 23.252 |
| 17.0865 | 23.252 |
| 17.091 | 23.275 |
| 17.0955 | 23.275 |
| 17.1 | 23.298 |
| 17.1045 | 23.298 |
| 17.109 | 23.321 |
| 17.1135 | 23.321 |
| 17.118 | 23.343 |
| 17.1225 | 23.364 |
| 17.127 | 23.364 |
| 17.1315 | 23.386 |
| 17.136 | 23.386 |
| 17.1405 | 23.407 |
| 17.145 | 23.407 |
| 17.1495 | 23.428 |
| 17.154 | 23.45 |
| 17.1585 | 23.45 |
| 17.163 | 23.471 |
| 17.1675 | 23.471 |
| 17.172 | 23.492 |
| 17.1765 | 23.492 |
| 17.181 | 23.512 |
| 17.1855 | 23.512 |
| 17.19 | 23.532 |
| 17.1945 | 23.553 |
| 17.199 | 23.553 |
| 17.2035 | 23.573 |
| 17.208 | 23.573 |
| 17.2125 | 23.593 |
| 17.217 | 23.593 |
| 17.2215 | 23.613 |
| 17.226 | 23.613 |
| 17.2305 | 23.633 |
| 17.235 | 23.653 |
| 17.2395 | 23.653 |
| 17.244 | 23.672 |
| 17.2485 | 23.672 |
| 17.253 | 23.692 |
| 17.2575 | 23.692 |
| 17.262 | 23.712 |
| 17.2665 | 23.722 |
| 17.271 | 23.731 |
| 17.2755 | 23.751 |
| 17.28 | 23.751 |
| 17.2845 | 23.77 |
| 17.289 | 23.77 |
| 17.2935 | 23.789 |
| 17.298 | 23.789 |
| 17.3025 | 23.808 |
| 17.307 | 23.826 |
| 17.3115 | 23.826 |
| 17.316 | 23.845 |
| 17.3205 | 23.845 |
| 17.325 | 23.864 |
| 17.3295 | 23.864 |
| 17.334 | 23.882 |
| 17.3385 | 23.882 |
| 17.343 | 23.9 |
| 17.3475 | 23.919 |
| 17.352 | 23.919 |
| 17.3565 | 23.937 |
| 17.361 | 23.937 |
| 17.3655 | 23.955 |
| 17.37 | 23.955 |
| 17.3745 | 23.973 |
| 17.379 | 23.973 |
| 17.3835 | 23.991 |
| 17.388 | 24.009 |
| 17.3925 | 24.009 |
| 17.397 | 24.027 |
| 17.4015 | 24.027 |
| 17.406 | 24.046 |
| 17.4105 | 24.046 |
| 17.415 | 24.065 |
| 17.4195 | 24.075 |
| 17.424 | 24.085 |
| 17.4285 | 24.104 |
| 17.433 | 24.104 |
| 17.4375 | 24.124 |
| 17.442 | 24.124 |
| 17.4465 | 24.143 |
| 17.451 | 24.143 |
| 17.4555 | 24.162 |
| 17.46 | 24.183 |
| 17.4645 | 24.183 |
| 17.469 | 24.205 |
| 17.4735 | 24.205 |
| 17.478 | 24.226 |
| 17.4825 | 24.226 |
| 17.487 | 24.248 |
| 17.4915 | 24.248 |
| 17.496 | 24.27 |
| 17.5005 | 24.291 |
| 17.505 | 24.291 |
| 17.5095 | 24.313 |
| 17.514 | 24.313 |
| 17.5185 | 24.335 |
| 17.523 | 24.335 |
| 17.5275 | 24.357 |
| 17.532 | 24.357 |
| 17.5365 | 24.379 |
| 17.541 | 24.401 |
| 17.5455 | 24.401 |
| 17.55 | 24.423 |
| 17.5545 | 24.423 |
| 17.559 | 24.446 |
| 17.5635 | 24.446 |
| 17.568 | 24.468 |
| 17.5725 | 24.49 |
| 17.577 | 24.49 |
| 17.5815 | 24.51 |
| 17.586 | 24.51 |
| 17.5905 | 24.53 |
| 17.595 | 24.53 |
| 17.5995 | 24.55 |
| 17.604 | 24.55 |
| 17.6085 | 24.57 |
| 17.613 | 24.59 |
| 17.6175 | 24.59 |
| 17.622 | 24.61 |
| 17.6265 | 24.61 |
| 17.631 | 24.63 |
| 17.6355 | 24.63 |
| 17.64 | 24.649 |
| 17.6445 | 24.649 |
| 17.649 | 24.667 |
| 17.6535 | 24.684 |
| 17.658 | 24.684 |
| 17.6625 | 24.702 |
| 17.667 | 24.702 |
| 17.6715 | 24.72 |
| 17.676 | 24.72 |
| 17.6805 | 24.737 |
| 17.685 | 24.737 |
| 17.6895 | 24.755 |
| 17.694 | 24.772 |
| 17.6985 | 24.772 |
| 17.703 | 24.789 |
| 17.7075 | 24.789 |
| 17.712 | 24.806 |
| 17.7165 | 24.806 |
| 17.721 | 24.823 |
| 17.7255 | 24.84 |
| 17.73 | 24.84 |
| 17.7345 | 24.857 |
| 17.739 | 24.857 |
| 17.7435 | 24.874 |
| 17.748 | 24.874 |
| 17.7525 | 24.891 |
| 17.757 | 24.891 |
| 17.7615 | 24.908 |
| 17.766 | 24.924 |
| 17.7705 | 24.924 |
| 17.775 | 24.941 |
| 17.7795 | 24.941 |
| 17.784 | 24.958 |
| 17.7885 | 24.958 |
| 17.793 | 24.975 |
| 17.7975 | 24.975 |
| 17.802 | 24.992 |
| 17.8065 | 25.008 |
| 17.811 | 25.008 |
| 17.8155 | 25.025 |
| 17.82 | 25.025 |
| 17.8245 | 25.042 |
| 17.829 | 25.042 |
| 17.8335 | 25.058 |
| 17.838 | 25.058 |
| 17.8425 | 25.074 |
| 17.847 | 25.091 |
| 17.8515 | 25.091 |
| 17.856 | 25.107 |
| 17.8605 | 25.107 |
| 17.865 | 25.123 |
| 17.8695 | 25.123 |
| 17.874 | 25.139 |
| 17.8785 | 25.156 |
| 17.883 | 25.156 |
| 17.8875 | 25.173 |
| 17.892 | 25.173 |
| 17.8965 | 25.19 |
| 17.901 | 25.19 |
| 17.9055 | 25.207 |
| 17.91 | 25.207 |
| 17.9145 | 25.224 |
| 17.919 | 25.241 |
| 17.9235 | 25.241 |
| 17.928 | 25.257 |
| 17.9325 | 25.257 |
| 17.937 | 25.274 |
| 17.9415 | 25.274 |
| 17.946 | 25.292 |
| 17.9505 | 25.292 |
| 17.955 | 25.311 |
| 17.9595 | 25.33 |
| 17.964 | 25.33 |
| 17.9685 | 25.348 |
| 17.973 | 25.348 |
| 17.9775 | 25.367 |
| 17.982 | 25.367 |
| 17.9865 | 25.386 |
| 17.991 | 25.395 |
| 17.9955 | 25.405 |
| 18.0 | 25.423 |
| 18.0045 | 25.423 |
| 18.009 | 25.443 |
| 18.0135 | 25.443 |
| 18.018 | 25.462 |
| 18.0225 | 25.462 |
| 18.027 | 25.482 |
| 18.0315 | 25.501 |
| 18.036 | 25.501 |
| 18.0405 | 25.521 |
| 18.045 | 25.521 |
| 18.0495 | 25.54 |
| 18.054 | 25.54 |
| 18.0585 | 25.56 |
| 18.063 | 25.56 |
| 18.0675 | 25.579 |
| 18.072 | 25.598 |
| 18.0765 | 25.598 |
| 18.081 | 25.616 |
| 18.0855 | 25.616 |
| 18.09 | 25.634 |
| 18.0945 | 25.634 |
| 18.099 | 25.653 |
| 18.1035 | 25.653 |
| 18.108 | 25.671 |
| 18.1125 | 25.689 |
| 18.117 | 25.689 |
| 18.1215 | 25.707 |
| 18.126 | 25.707 |
| 18.1305 | 25.725 |
| 18.135 | 25.725 |
| 18.1395 | 25.742 |
| 18.144 | 25.758 |
| 18.1485 | 25.758 |
| 18.153 | 25.774 |
| 18.1575 | 25.774 |
| 18.162 | 25.791 |
| 18.1665 | 25.791 |
| 18.171 | 25.807 |
| 18.1755 | 25.807 |
| 18.18 | 25.823 |
| 18.1845 | 25.839 |
| 18.189 | 25.839 |
| 18.1935 | 25.855 |
| 18.198 | 25.855 |
| 18.2025 | 25.87 |
| 18.207 | 25.87 |
| 18.2115 | 25.885 |
| 18.216 | 25.885 |
| 18.2205 | 25.9 |
| 18.225 | 25.915 |
| 18.2295 | 25.915 |
| 18.234 | 25.93 |
| 18.2385 | 25.93 |
| 18.243 | 25.945 |
| 18.2475 | 25.945 |
| 18.252 | 25.959 |
| 18.2565 | 25.959 |
| 18.261 | 25.974 |
| 18.2655 | 25.988 |
| 18.27 | 25.988 |
| 18.2745 | 26.002 |
| 18.279 | 26.002 |
| 18.2835 | 26.016 |
| 18.288 | 26.016 |
| 18.2925 | 26.031 |
| 18.297 | 26.045 |
| 18.3015 | 26.045 |
| 18.306 | 26.059 |
| 18.3105 | 26.059 |
| 18.315 | 26.073 |
| 18.3195 | 26.073 |
| 18.324 | 26.087 |
| 18.3285 | 26.087 |
| 18.333 | 26.101 |
| 18.3375 | 26.115 |
| 18.342 | 26.115 |
| 18.3465 | 26.129 |
| 18.351 | 26.129 |
| 18.3555 | 26.143 |
| 18.36 | 26.143 |
| 18.3645 | 26.157 |
| 18.369 | 26.157 |
| 18.3735 | 26.171 |
| 18.378 | 26.184 |
| 18.3825 | 26.184 |
| 18.387 | 26.199 |
| 18.3915 | 26.199 |
| 18.396 | 26.214 |
| 18.4005 | 26.214 |
| 18.405 | 26.229 |
| 18.4095 | 26.229 |
| 18.414 | 26.244 |
| 18.4185 | 26.259 |
| 18.423 | 26.259 |
| 18.4275 | 26.274 |
| 18.432 | 26.274 |
| 18.4365 | 26.289 |
| 18.441 | 26.289 |
| 18.4455 | 26.304 |
| 18.45 | 26.32 |
| 18.4545 | 26.32 |
| 18.459 | 26.337 |
| 18.4635 | 26.337 |
| 18.468 | 26.355 |
| 18.4725 | 26.355 |
| 18.477 | 26.373 |
| 18.4815 | 26.373 |
| 18.486 | 26.391 |
| 18.4905 | 26.409 |
| 18.495 | 26.409 |
| 18.4995 | 26.426 |
| 18.504 | 26.426 |
| 18.5085 | 26.444 |
| 18.513 | 26.444 |
| 18.5175 | 26.463 |
| 18.522 | 26.463 |
| 18.5265 | 26.482 |
| 18.531 | 26.503 |
| 18.5355 | 26.503 |
| 18.54 | 26.523 |
| 18.5445 | 26.523 |
| 18.549 | 26.544 |
| 18.5535 | 26.544 |
| 18.558 | 26.564 |
| 18.5625 | 26.574 |
| 18.567 | 26.584 |
| 18.5715 | 26.605 |
| 18.576 | 26.605 |
| 18.5805 | 26.625 |
| 18.585 | 26.625 |
| 18.5895 | 26.645 |
| 18.594 | 26.645 |
| 18.5985 | 26.664 |
| 18.603 | 26.684 |
| 18.6075 | 26.684 |
| 18.612 | 26.704 |
| 18.6165 | 26.704 |
| 18.621 | 26.723 |
| 18.6255 | 26.723 |
| 18.63 | 26.743 |
| 18.6345 | 26.743 |
| 18.639 | 26.762 |
| 18.6435 | 26.782 |
| 18.648 | 26.782 |
| 18.6525 | 26.8 |
| 18.657 | 26.8 |
| 18.6615 | 26.817 |
| 18.666 | 26.817 |
| 18.6705 | 26.833 |
| 18.675 | 26.833 |
| 18.6795 | 26.85 |
| 18.684 | 26.866 |
| 18.6885 | 26.866 |
| 18.693 | 26.882 |
| 18.6975 | 26.882 |
| 18.702 | 26.899 |
| 18.7065 | 26.899 |
| 18.711 | 26.915 |
| 18.7155 | 26.924 |
| 18.72 | 26.932 |
| 18.7245 | 26.947 |
| 18.729 | 26.947 |
| 18.7335 | 26.963 |
| 18.738 | 26.963 |
| 18.7425 | 26.978 |
| 18.747 | 26.978 |
| 18.7515 | 26.994 |
| 18.756 | 27.009 |
| 18.7605 | 27.009 |
| 18.765 | 27.025 |
| 18.7695 | 27.025 |
| 18.774 | 27.04 |
| 18.7785 | 27.04 |
| 18.783 | 27.056 |
| 18.7875 | 27.056 |
| 18.792 | 27.073 |
| 18.7965 | 27.091 |
| 18.801 | 27.091 |
| 18.8055 | 27.11 |
| 18.81 | 27.11 |
| 18.8145 | 27.128 |
| 18.819 | 27.128 |
| 18.8235 | 27.146 |
| 18.828 | 27.146 |
| 18.8325 | 27.165 |
| 18.837 | 27.183 |
| 18.8415 | 27.183 |
| 18.846 | 27.201 |
| 18.8505 | 27.201 |
| 18.855 | 27.221 |
| 18.8595 | 27.221 |
| 18.864 | 27.242 |
| 18.8685 | 27.264 |
| 18.873 | 27.264 |
| 18.8775 | 27.285 |
| 18.882 | 27.285 |
| 18.8865 | 27.307 |
| 18.891 | 27.307 |
| 18.8955 | 27.329 |
| 18.9 | 27.329 |
| 18.9045 | 27.351 |
| 18.909 | 27.373 |
| 18.9135 | 27.373 |
| 18.918 | 27.394 |
| 18.9225 | 27.394 |
| 18.927 | 27.416 |
| 18.9315 | 27.416 |
| 18.936 | 27.438 |
| 18.9405 | 27.438 |
| 18.945 | 27.461 |
| 18.9495 | 27.483 |
| 18.954 | 27.483 |
| 18.9585 | 27.505 |
| 18.963 | 27.505 |
| 18.9675 | 27.527 |
| 18.972 | 27.527 |
| 18.9765 | 27.549 |
| 18.981 | 27.549 |
| 18.9855 | 27.571 |
| 18.99 | 27.593 |
| 18.9945 | 27.593 |
| 18.999 | 27.614 |
| 19.0035 | 27.614 |
| 19.008 | 27.634 |
| 19.0125 | 27.634 |
| 19.017 | 27.654 |
| 19.0215 | 27.674 |
| 19.026 | 27.674 |
| 19.0305 | 27.694 |
| 19.035 | 27.694 |
| 19.0395 | 27.714 |
| 19.044 | 27.714 |
| 19.0485 | 27.734 |
| 19.053 | 27.734 |
| 19.0575 | 27.754 |
| 19.062 | 27.774 |
| 19.0665 | 27.774 |
| 19.071 | 27.793 |
| 19.0755 | 27.793 |
| 19.08 | 27.812 |
| 19.0845 | 27.812 |
| 19.089 | 27.831 |
| 19.0935 | 27.831 |
| 19.098 | 27.85 |
| 19.1025 | 27.869 |
| 19.107 | 27.869 |
| 19.1115 | 27.888 |
| 19.116 | 27.888 |
| 19.1205 | 27.907 |
| 19.125 | 27.907 |
| 19.1295 | 27.926 |
| 19.134 | 27.926 |
| 19.1385 | 27.945 |
| 19.143 | 27.964 |
| 19.1475 | 27.964 |
| 19.152 | 27.983 |
| 19.1565 | 27.983 |
| 19.161 | 28.002 |
| 19.1655 | 28.002 |
| 19.17 | 28.021 |
| 19.1745 | 28.04 |
| 19.179 | 28.04 |
| 19.1835 | 28.059 |
| 19.188 | 28.059 |
| 19.1925 | 28.078 |
| 19.197 | 28.078 |
| 19.2015 | 28.096 |
| 19.206 | 28.096 |
| 19.2105 | 28.115 |
| 19.215 | 28.134 |
| 19.2195 | 28.134 |
| 19.224 | 28.153 |
| 19.2285 | 28.153 |
| 19.233 | 28.172 |
| 19.2375 | 28.172 |
| 19.242 | 28.19 |
| 19.2465 | 28.19 |
| 19.251 | 28.209 |
| 19.2555 | 28.228 |
| 19.26 | 28.228 |
| 19.2645 | 28.247 |
| 19.269 | 28.247 |
| 19.2735 | 28.266 |
| 19.278 | 28.266 |
| 19.2825 | 28.285 |
| 19.287 | 28.295 |
| 19.2915 | 28.305 |
| 19.296 | 28.324 |
| 19.3005 | 28.324 |
| 19.305 | 28.344 |
| 19.3095 | 28.344 |
| 19.314 | 28.364 |
| 19.3185 | 28.364 |
| 19.323 | 28.383 |
| 19.3275 | 28.403 |
| 19.332 | 28.403 |
| 19.3365 | 28.422 |
| 19.341 | 28.422 |
| 19.3455 | 28.442 |
| 19.35 | 28.442 |
| 19.3545 | 28.462 |
| 19.359 | 28.462 |
| 19.3635 | 28.483 |
| 19.368 | 28.504 |
| 19.3725 | 28.504 |
| 19.377 | 28.524 |
| 19.3815 | 28.524 |
| 19.386 | 28.545 |
| 19.3905 | 28.545 |
| 19.395 | 28.565 |
| 19.3995 | 28.565 |
| 19.404 | 28.586 |
| 19.4085 | 28.606 |
| 19.413 | 28.606 |
| 19.4175 | 28.627 |
| 19.422 | 28.627 |
| 19.4265 | 28.648 |
| 19.431 | 28.648 |
| 19.4355 | 28.669 |
| 19.44 | 28.69 |
| 19.4445 | 28.69 |
| 19.449 | 28.711 |
| 19.4535 | 28.711 |
| 19.458 | 28.732 |
| 19.4625 | 28.732 |
| 19.467 | 28.753 |
| 19.4715 | 28.753 |
| 19.476 | 28.774 |
| 19.4805 | 28.795 |
| 19.485 | 28.795 |
| 19.4895 | 28.816 |
| 19.494 | 28.816 |
| 19.4985 | 28.838 |
| 19.503 | 28.838 |
| 19.5075 | 28.861 |
| 19.512 | 28.861 |
| 19.5165 | 28.883 |
| 19.521 | 28.906 |
| 19.5255 | 28.906 |
| 19.53 | 28.928 |
| 19.5345 | 28.928 |
| 19.539 | 28.951 |
| 19.5435 | 28.951 |
| 19.548 | 28.974 |
| 19.5525 | 28.974 |
| 19.557 | 28.996 |
| 19.5615 | 29.019 |
| 19.566 | 29.019 |
| 19.5705 | 29.043 |
| 19.575 | 29.043 |
| 19.5795 | 29.068 |
| 19.584 | 29.068 |
| 19.5885 | 29.093 |
| 19.593 | 29.118 |
| 19.5975 | 29.118 |
| 19.602 | 29.144 |
| 19.6065 | 29.144 |
| 19.611 | 29.169 |
| 19.6155 | 29.169 |
| 19.62 | 29.194 |
| 19.6245 | 29.194 |
| 19.629 | 29.219 |
| 19.6335 | 29.244 |
| 19.638 | 29.244 |
| 19.6425 | 29.27 |
| 19.647 | 29.27 |
| 19.6515 | 29.296 |
| 19.656 | 29.296 |
| 19.6605 | 29.323 |
| 19.665 | 29.323 |
| 19.6695 | 29.35 |
| 19.674 | 29.377 |
| 19.6785 | 29.377 |
| 19.683 | 29.404 |
| 19.6875 | 29.404 |
| 19.692 | 29.43 |
| 19.6965 | 29.43 |
| 19.701 | 29.457 |
| 19.7055 | 29.457 |
| 19.71 | 29.484 |
| 19.7145 | 29.511 |
| 19.719 | 29.511 |
| 19.7235 | 29.538 |
| 19.728 | 29.538 |
| 19.7325 | 29.566 |
| 19.737 | 29.566 |
| 19.7415 | 29.594 |
| 19.746 | 29.622 |
| 19.7505 | 29.622 |
| 19.755 | 29.65 |
| 19.7595 | 29.65 |
| 19.764 | 29.677 |
| 19.7685 | 29.677 |
| 19.773 | 29.705 |
| 19.7775 | 29.705 |
| 19.782 | 29.733 |
| 19.7865 | 29.761 |
| 19.791 | 29.761 |
| 19.7955 | 29.789 |
| 19.8 | 29.789 |
| 19.8045 | 29.818 |
| 19.809 | 29.818 |
| 19.8135 | 29.847 |
| 19.818 | 29.847 |
| 19.8225 | 29.876 |
| 19.827 | 29.904 |
| 19.8315 | 29.904 |
| 19.836 | 29.933 |
| 19.8405 | 29.933 |
| 19.845 | 29.962 |
| 19.8495 | 29.962 |
| 19.854 | 29.991 |
| 19.8585 | 30.005 |
| 19.863 | 30.019 |
| 19.8675 | 30.048 |
| 19.872 | 30.048 |
| 19.8765 | 30.077 |
| 19.881 | 30.077 |
| 19.8855 | 30.105 |
| 19.89 | 30.105 |
| 19.8945 | 30.134 |
| 19.899 | 30.162 |
| 19.9035 | 30.162 |
| 19.908 | 30.191 |
| 19.9125 | 30.191 |
| 19.917 | 30.219 |
| 19.9215 | 30.219 |
| 19.926 | 30.248 |
| 19.9305 | 30.248 |
| 19.935 | 30.276 |
| 19.9395 | 30.304 |
| 19.944 | 30.304 |
| 19.9485 | 30.332 |
| 19.953 | 30.332 |
| 19.9575 | 30.359 |
| 19.962 | 30.359 |
| 19.9665 | 30.386 |
| 19.971 | 30.386 |
| 19.9755 | 30.413 |
| 19.98 | 30.44 |
| 19.9845 | 30.44 |
| 19.989 | 30.466 |
| 19.9935 | 30.466 |
| 19.998 | 30.493 |
| 20.0025 | 30.493 |
| 20.007 | 30.52 |
| 20.0115 | 30.533 |
| 20.016 | 30.547 |
| 20.0205 | 30.573 |
| 20.025 | 30.573 |
| 20.0295 | 30.598 |
| 20.034 | 30.598 |
| 20.0385 | 30.623 |
| 20.043 | 30.623 |
| 20.0475 | 30.648 |
| 20.052 | 30.673 |
| 20.0565 | 30.673 |
| 20.061 | 30.698 |
| 20.0655 | 30.698 |
| 20.07 | 30.722 |
| 20.0745 | 30.722 |
| 20.079 | 30.747 |
| 20.0835 | 30.747 |
| 20.088 | 30.772 |
| 20.0925 | 30.797 |
| 20.097 | 30.797 |
| 20.1015 | 30.821 |
| 20.106 | 30.821 |
| 20.1105 | 30.845 |
| 20.115 | 30.845 |
| 20.1195 | 30.869 |
| 20.124 | 30.869 |
| 20.1285 | 30.893 |
| 20.133 | 30.917 |
| 20.1375 | 30.917 |
| 20.142 | 30.941 |
| 20.1465 | 30.941 |
| 20.151 | 30.965 |
| 20.1555 | 30.965 |
| 20.16 | 30.988 |
| 20.1645 | 31.012 |
| 20.169 | 31.012 |
| 20.1735 | 31.036 |
| 20.178 | 31.036 |
| 20.1825 | 31.062 |
| 20.187 | 31.062 |
| 20.1915 | 31.087 |
| 20.196 | 31.087 |
| 20.2005 | 31.113 |
| 20.205 | 31.138 |
| 20.2095 | 31.138 |
| 20.214 | 31.164 |
| 20.2185 | 31.164 |
| 20.223 | 31.189 |
| 20.2275 | 31.189 |
| 20.232 | 31.215 |
| 20.2365 | 31.215 |
| 20.241 | 31.24 |
| 20.2455 | 31.266 |
| 20.25 | 31.266 |
| 20.2545 | 31.292 |
| 20.259 | 31.292 |
| 20.2635 | 31.321 |
| 20.268 | 31.321 |
| 20.2725 | 31.35 |
| 20.277 | 31.35 |
| 20.2815 | 31.379 |
| 20.286 | 31.407 |
| 20.2905 | 31.407 |
| 20.295 | 31.436 |
| 20.2995 | 31.436 |
| 20.304 | 31.465 |
| 20.3085 | 31.465 |
| 20.313 | 31.494 |
| 20.3175 | 31.523 |
| 20.322 | 31.523 |
| 20.3265 | 31.552 |
| 20.331 | 31.552 |
| 20.3355 | 31.582 |
| 20.34 | 31.582 |
| 20.3445 | 31.614 |
| 20.349 | 31.614 |
| 20.3535 | 31.647 |
| 20.358 | 31.679 |
| 20.3625 | 31.679 |
| 20.367 | 31.711 |
| 20.3715 | 31.711 |
| 20.376 | 31.744 |
| 20.3805 | 31.744 |
| 20.385 | 31.776 |
| 20.3895 | 31.776 |
| 20.394 | 31.808 |
| 20.3985 | 31.841 |
| 20.403 | 31.841 |
| 20.4075 | 31.873 |
| 20.412 | 31.873 |
| 20.4165 | 31.907 |
| 20.421 | 31.907 |
| 20.4255 | 31.942 |
| 20.43 | 31.96 |
| 20.4345 | 31.978 |
| 20.439 | 32.015 |
| 20.4435 | 32.015 |
| 20.448 | 32.051 |
| 20.4525 | 32.051 |
| 20.457 | 32.087 |
| 20.4615 | 32.087 |
| 20.466 | 32.123 |
| 20.4705 | 32.158 |
| 20.475 | 32.158 |
| 20.4795 | 32.194 |
| 20.484 | 32.194 |
| 20.4885 | 32.23 |
| 20.493 | 32.23 |
| 20.4975 | 32.268 |
| 20.502 | 32.268 |
| 20.5065 | 32.307 |
| 20.511 | 32.346 |
| 20.5155 | 32.346 |
| 20.52 | 32.386 |
| 20.5245 | 32.386 |
| 20.529 | 32.425 |
| 20.5335 | 32.425 |
| 20.538 | 32.465 |
| 20.5425 | 32.465 |
| 20.547 | 32.504 |
| 20.5515 | 32.543 |
| 20.556 | 32.543 |
| 20.5605 | 32.583 |
| 20.565 | 32.583 |
| 20.5695 | 32.622 |
| 20.574 | 32.622 |
| 20.5785 | 32.661 |
| 20.583 | 32.681 |
| 20.5875 | 32.701 |
| 20.592 | 32.74 |
| 20.5965 | 32.74 |
| 20.601 | 32.78 |
| 20.6055 | 32.78 |
| 20.61 | 32.82 |
| 20.6145 | 32.82 |
| 20.619 | 32.859 |
| 20.6235 | 32.899 |
| 20.628 | 32.899 |
| 20.6325 | 32.938 |
| 20.637 | 32.938 |
| 20.6415 | 32.978 |
| 20.646 | 32.978 |
| 20.6505 | 33.017 |
| 20.655 | 33.017 |
| 20.6595 | 33.056 |
| 20.664 | 33.093 |
| 20.6685 | 33.093 |
| 20.673 | 33.129 |
| 20.6775 | 33.129 |
| 20.682 | 33.165 |
| 20.6865 | 33.165 |
| 20.691 | 33.201 |
| 20.6955 | 33.201 |
| 20.7 | 33.237 |
| 20.7045 | 33.273 |
| 20.709 | 33.273 |
| 20.7135 | 33.309 |
| 20.718 | 33.309 |
| 20.7225 | 33.345 |
| 20.727 | 33.345 |
| 20.7315 | 33.381 |
| 20.736 | 33.416 |
| 20.7405 | 33.416 |
| 20.745 | 33.451 |
| 20.7495 | 33.451 |
| 20.754 | 33.484 |
| 20.7585 | 33.484 |
| 20.763 | 33.517 |
| 20.7675 | 33.517 |
| 20.772 | 33.551 |
| 20.7765 | 33.584 |
| 20.781 | 33.584 |
| 20.7855 | 33.617 |
| 20.79 | 33.617 |
| 20.7945 | 33.651 |
| 20.799 | 33.651 |
| 20.8035 | 33.684 |
| 20.808 | 33.684 |
| 20.8125 | 33.717 |
| 20.817 | 33.75 |
| 20.8215 | 33.75 |
| 20.826 | 33.784 |
| 20.8305 | 33.784 |
| 20.835 | 33.819 |
| 20.8395 | 33.819 |
| 20.844 | 33.853 |
| 20.8485 | 33.853 |
| 20.853 | 33.888 |
| 20.8575 | 33.922 |
| 20.862 | 33.922 |
| 20.8665 | 33.956 |
| 20.871 | 33.956 |
| 20.8755 | 33.991 |
| 20.88 | 33.991 |
| 20.8845 | 34.025 |
| 20.889 | 34.059 |
| 20.8935 | 34.059 |
| 20.898 | 34.094 |
| 20.9025 | 34.094 |
| 20.907 | 34.129 |
| 20.9115 | 34.129 |
| 20.916 | 34.166 |
| 20.9205 | 34.166 |
| 20.925 | 34.204 |
| 20.9295 | 34.242 |
| 20.934 | 34.242 |
| 20.9385 | 34.28 |
| 20.943 | 34.28 |
| 20.9475 | 34.318 |
| 20.952 | 34.318 |
| 20.9565 | 34.356 |
| 20.961 | 34.356 |
| 20.9655 | 34.394 |
| 20.97 | 34.432 |
| 20.9745 | 34.432 |
| 20.979 | 34.47 |
| 20.9835 | 34.47 |
| 20.988 | 34.508 |
| 20.9925 | 34.508 |
| 20.997 | 34.548 |
| 21.0015 | 34.548 |
| 21.006 | 34.59 |
| 21.0105 | 34.632 |
| 21.015 | 34.632 |
| 21.0195 | 34.674 |
| 21.024 | 34.674 |
| 21.0285 | 34.716 |
| 21.033 | 34.716 |
| 21.0375 | 34.758 |
| 21.042 | 34.8 |
| 21.0465 | 34.8 |
| 21.051 | 34.842 |
| 21.0555 | 34.842 |
| 21.06 | 34.884 |
| 21.0645 | 34.884 |
| 21.069 | 34.926 |
| 21.0735 | 34.926 |
| 21.078 | 34.968 |
| 21.0825 | 35.011 |
| 21.087 | 35.011 |
| 21.0915 | 35.055 |
| 21.096 | 35.055 |
| 21.1005 | 35.099 |
| 21.105 | 35.099 |
| 21.1095 | 35.143 |
| 21.114 | 35.143 |
| 21.1185 | 35.187 |
| 21.123 | 35.23 |
| 21.1275 | 35.23 |
| 21.132 | 35.274 |
| 21.1365 | 35.274 |
| 21.141 | 35.318 |
| 21.1455 | 35.318 |
| 21.15 | 35.362 |
| 21.1545 | 35.383 |
| 21.159 | 35.405 |
| 21.1635 | 35.448 |
| 21.168 | 35.448 |
| 21.1725 | 35.491 |
| 21.177 | 35.491 |
| 21.1815 | 35.534 |
| 21.186 | 35.534 |
| 21.1905 | 35.576 |
| 21.195 | 35.618 |
| 21.1995 | 35.618 |
| 21.204 | 35.661 |
| 21.2085 | 35.661 |
| 21.213 | 35.703 |
| 21.2175 | 35.703 |
| 21.222 | 35.745 |
| 21.2265 | 35.745 |
| 21.231 | 35.787 |
| 21.2355 | 35.83 |
| 21.24 | 35.83 |
| 21.2445 | 35.872 |
| 21.249 | 35.872 |
| 21.2535 | 35.913 |
| 21.258 | 35.913 |
| 21.2625 | 35.953 |
| 21.267 | 35.953 |
| 21.2715 | 35.992 |
| 21.276 | 36.032 |
| 21.2805 | 36.032 |
| 21.285 | 36.072 |
| 21.2895 | 36.072 |
| 21.294 | 36.111 |
| 21.2985 | 36.111 |
| 21.303 | 36.151 |
| 21.3075 | 36.171 |
| 21.312 | 36.191 |
| 21.3165 | 36.23 |
| 21.321 | 36.23 |
| 21.3255 | 36.27 |
| 21.33 | 36.27 |
| 21.3345 | 36.309 |
| 21.339 | 36.309 |
| 21.3435 | 36.348 |
| 21.348 | 36.385 |
| 21.3525 | 36.385 |
| 21.357 | 36.423 |
| 21.3615 | 36.423 |
| 21.366 | 36.46 |
| 21.3705 | 36.46 |
| 21.375 | 36.498 |
| 21.3795 | 36.498 |
| 21.384 | 36.535 |
| 21.3885 | 36.572 |
| 21.393 | 36.572 |
| 21.3975 | 36.61 |
| 21.402 | 36.61 |
| 21.4065 | 36.647 |
| 21.411 | 36.647 |
| 21.4155 | 36.684 |
| 21.42 | 36.684 |
| 21.4245 | 36.721 |
| 21.429 | 36.757 |
| 21.4335 | 36.757 |
| 21.438 | 36.792 |
| 21.4425 | 36.792 |
| 21.447 | 36.826 |
| 21.4515 | 36.826 |
| 21.456 | 36.861 |
| 21.4605 | 36.895 |
| 21.465 | 36.895 |
| 21.4695 | 36.93 |
| 21.474 | 36.93 |
| 21.4785 | 36.964 |
| 21.483 | 36.964 |
| 21.4875 | 36.999 |
| 21.492 | 36.999 |
| 21.4965 | 37.033 |
| 21.501 | 37.068 |
| 21.5055 | 37.068 |
| 21.51 | 37.102 |
| 21.5145 | 37.102 |
| 21.519 | 37.135 |
| 21.5235 | 37.135 |
| 21.528 | 37.165 |
| 21.5325 | 37.165 |
| 21.537 | 37.196 |
| 21.5415 | 37.226 |
| 21.546 | 37.226 |
| 21.5505 | 37.257 |
| 21.555 | 37.257 |
| 21.5595 | 37.287 |
| 21.564 | 37.287 |
| 21.5685 | 37.318 |
| 21.573 | 37.318 |
| 21.5775 | 37.348 |
| 21.582 | 37.379 |
| 21.5865 | 37.379 |
| 21.591 | 37.409 |
| 21.5955 | 37.409 |
| 21.6 | 37.44 |
| 21.6045 | 37.44 |
| 21.609 | 37.468 |
| 21.6135 | 37.493 |
| 21.618 | 37.493 |
| 21.6225 | 37.518 |
| 21.627 | 37.518 |
| 21.6315 | 37.543 |
| 21.636 | 37.543 |
| 21.6405 | 37.568 |
| 21.645 | 37.568 |
| 21.6495 | 37.593 |
| 21.654 | 37.618 |
| 21.6585 | 37.618 |
| 21.663 | 37.643 |
| 21.6675 | 37.643 |
| 21.672 | 37.668 |
| 21.6765 | 37.668 |
| 21.681 | 37.692 |
| 21.6855 | 37.692 |
| 21.69 | 37.717 |
| 21.6945 | 37.739 |
| 21.699 | 37.739 |
| 21.7035 | 37.757 |
| 21.708 | 37.757 |
| 21.7125 | 37.773 |
| 21.717 | 37.773 |
| 21.7215 | 37.789 |
| 21.726 | 37.797 |
| 21.7305 | 37.805 |
| 21.735 | 37.821 |
| 21.7395 | 37.821 |
| 21.744 | 37.837 |
| 21.7485 | 37.837 |
| 21.753 | 37.853 |
| 21.7575 | 37.853 |
| 21.762 | 37.869 |
| 21.7665 | 37.885 |
| 21.771 | 37.885 |
| 21.7755 | 37.901 |
| 21.78 | 37.901 |
| 21.7845 | 37.915 |
| 21.789 | 37.915 |
| 21.7935 | 37.923 |
| 21.798 | 37.923 |
| 21.8025 | 37.927 |
| 21.807 | 37.93 |
| 21.8115 | 37.93 |
| 21.816 | 37.934 |
| 21.8205 | 37.934 |
| 21.825 | 37.938 |
| 21.8295 | 37.938 |
| 21.834 | 37.941 |
| 21.8385 | 37.941 |
| 21.843 | 37.945 |
| 21.8475 | 37.949 |
| 21.852 | 37.949 |
| 21.8565 | 37.953 |
| 21.861 | 37.953 |
| 21.8655 | 37.956 |
| 21.87 | 37.956 |
| 21.8745 | 37.96 |
| 21.879 | 37.962 |
| 21.8835 | 37.957 |
| 21.888 | 37.946 |
| 21.8925 | 37.946 |
| 21.897 | 37.934 |
| 21.9015 | 37.934 |
| 21.906 | 37.923 |
| 21.9105 | 37.923 |
| 21.915 | 37.911 |
| 21.9195 | 37.9 |
| 21.924 | 37.9 |
| 21.9285 | 37.888 |
| 21.933 | 37.888 |
| 21.9375 | 37.877 |
| 21.942 | 37.877 |
| 21.9465 | 37.865 |
| 21.951 | 37.865 |
| 21.9555 | 37.854 |
| 21.96 | 37.842 |
| 21.9645 | 37.842 |
| 21.969 | 37.826 |
| 21.9735 | 37.826 |
| 21.978 | 37.8 |
| 21.9825 | 37.8 |
| 21.987 | 37.767 |
| 21.9915 | 37.767 |
| 21.996 | 37.735 |
| 22.0005 | 37.702 |
| 22.005 | 37.702 |
| 22.0095 | 37.67 |
| 22.014 | 37.67 |
| 22.0185 | 37.638 |
| 22.023 | 37.638 |
| 22.0275 | 37.605 |
| 22.032 | 37.573 |
| 22.0365 | 37.573 |
| 22.041 | 37.54 |
| 22.0455 | 37.54 |
| 22.05 | 37.508 |
| 22.0545 | 37.508 |
| 22.059 | 37.476 |
| 22.0635 | 37.476 |
| 22.068 | 37.432 |
| 22.0725 | 37.374 |
| 22.077 | 37.374 |
| 22.0815 | 37.314 |
| 22.086 | 37.314 |
| 22.0905 | 37.254 |
| 22.095 | 37.254 |
| 22.0995 | 37.193 |
| 22.104 | 37.193 |
| 22.1085 | 37.133 |
| 22.113 | 37.073 |
| 22.1175 | 37.073 |
| 22.122 | 37.012 |
| 22.1265 | 37.012 |
| 22.131 | 36.952 |
| 22.1355 | 36.952 |
| 22.14 | 36.892 |
| 22.1445 | 36.892 |
| 22.149 | 36.832 |
| 22.1535 | 36.77 |
| 22.158 | 36.77 |
| 22.1625 | 36.695 |
| 22.167 | 36.695 |
| 22.1715 | 36.605 |
| 22.176 | 36.605 |
| 22.1805 | 36.515 |
| 22.185 | 36.426 |
| 22.1895 | 36.426 |
| 22.194 | 36.336 |
| 22.1985 | 36.336 |
| 22.203 | 36.247 |
| 22.2075 | 36.247 |
| 22.212 | 36.158 |
| 22.2165 | 36.158 |
| 22.221 | 36.069 |
| 22.2255 | 35.979 |
| 22.23 | 35.979 |
| 22.2345 | 35.89 |
| 22.239 | 35.89 |
| 22.2435 | 35.801 |
| 22.248 | 35.801 |
| 22.2525 | 35.709 |
| 22.257 | 35.709 |
| 22.2615 | 35.606 |
| 22.266 | 35.494 |
| 22.2705 | 35.494 |
| 22.275 | 35.382 |
| 22.2795 | 35.382 |
| 22.284 | 35.27 |
| 22.2885 | 35.27 |
| 22.293 | 35.159 |
| 22.2975 | 35.159 |
| 22.302 | 35.047 |
| 22.3065 | 34.936 |
| 22.311 | 34.936 |
| 22.3155 | 34.824 |
| 22.32 | 34.824 |
| 22.3245 | 34.713 |
| 22.329 | 34.713 |
| 22.3335 | 34.602 |
| 22.338 | 34.49 |
| 22.3425 | 34.49 |
| 22.347 | 34.377 |
| 22.3515 | 34.377 |
| 22.356 | 34.259 |
| 22.3605 | 34.259 |
| 22.365 | 34.136 |
| 22.3695 | 34.136 |
| 22.374 | 34.014 |
| 22.3785 | 33.891 |
| 22.383 | 33.891 |
| 22.3875 | 33.769 |
| 22.392 | 33.769 |
| 22.3965 | 33.647 |
| 22.401 | 33.647 |
| 22.4055 | 33.525 |
| 22.41 | 33.525 |
| 22.4145 | 33.403 |
| 22.419 | 33.281 |
| 22.4235 | 33.281 |
| 22.428 | 33.16 |
| 22.4325 | 33.16 |
| 22.437 | 33.038 |
| 22.4415 | 33.038 |
| 22.446 | 32.917 |
| 22.4505 | 32.856 |
| 22.455 | 32.797 |
| 22.4595 | 32.678 |
| 22.464 | 32.678 |
| 22.4685 | 32.559 |
| 22.473 | 32.559 |
| 22.4775 | 32.44 |
| 22.482 | 32.44 |
| 22.4865 | 32.322 |
| 22.491 | 32.203 |
| 22.4955 | 32.203 |
| 22.5 | 32.085 |
| 22.5045 | 32.085 |
| 22.509 | 31.966 |
| 22.5135 | 31.966 |
| 22.518 | 31.848 |
| 22.5225 | 31.848 |
| 22.527 | 31.73 |
| 22.5315 | 31.612 |
| 22.536 | 31.612 |
| 22.5405 | 31.495 |
| 22.545 | 31.495 |
| 22.5495 | 31.387 |
| 22.554 | 31.387 |
| 22.5585 | 31.286 |
| 22.563 | 31.286 |
| 22.5675 | 31.186 |
| 22.572 | 31.085 |
| 22.5765 | 31.085 |
| 22.581 | 30.984 |
| 22.5855 | 30.984 |
| 22.59 | 30.884 |
| 22.5945 | 30.884 |
| 22.599 | 30.783 |
| 22.6035 | 30.733 |
| 22.608 | 30.683 |
| 22.6125 | 30.582 |
| 22.617 | 30.582 |
| 22.6215 | 30.482 |
| 22.626 | 30.482 |
| 22.6305 | 30.382 |
| 22.635 | 30.382 |
| 22.6395 | 30.282 |
| 22.644 | 30.195 |
| 22.6485 | 30.195 |
| 22.653 | 30.123 |
| 22.6575 | 30.123 |
| 22.662 | 30.051 |
| 22.6665 | 30.051 |
| 22.671 | 29.979 |
| 22.6755 | 29.979 |
| 22.68 | 29.907 |
| 22.6845 | 29.836 |
| 22.689 | 29.836 |
| 22.6935 | 29.764 |
| 22.698 | 29.764 |
| 22.7025 | 29.692 |
| 22.707 | 29.692 |
| 22.7115 | 29.621 |
| 22.716 | 29.621 |
| 22.7205 | 29.549 |
| 22.725 | 29.478 |
| 22.7295 | 29.478 |
| 22.734 | 29.407 |
| 22.7385 | 29.407 |
| 22.743 | 29.345 |
| 22.7475 | 29.345 |
| 22.752 | 29.298 |
| 22.7565 | 29.257 |
| 22.761 | 29.257 |
| 22.7655 | 29.216 |
| 22.77 | 29.216 |
| 22.7745 | 29.174 |
| 22.779 | 29.174 |
| 22.7835 | 29.133 |
| 22.788 | 29.133 |
| 22.7925 | 29.092 |
| 22.797 | 29.051 |
| 22.8015 | 29.051 |
| 22.806 | 29.01 |
| 22.8105 | 29.01 |
| 22.815 | 28.969 |
| 22.8195 | 28.969 |
| 22.824 | 28.928 |
| 22.8285 | 28.928 |
| 22.833 | 28.887 |
| 22.8375 | 28.848 |
| 22.842 | 28.848 |
| 22.8465 | 28.82 |
| 22.851 | 28.82 |
| 22.8555 | 28.801 |
| 22.86 | 28.801 |
| 22.8645 | 28.783 |
| 22.869 | 28.783 |
| 22.8735 | 28.764 |
| 22.878 | 28.745 |
| 22.8825 | 28.745 |
| 22.887 | 28.727 |
| 22.8915 | 28.727 |
| 22.896 | 28.708 |
| 22.9005 | 28.708 |
| 22.905 | 28.689 |
| 22.9095 | 28.671 |
| 22.914 | 28.671 |
| 22.9185 | 28.652 |
| 22.923 | 28.652 |
| 22.9275 | 28.634 |
| 22.932 | 28.634 |
| 22.9365 | 28.615 |
| 22.941 | 28.615 |
| 22.9455 | 28.6 |
| 22.95 | 28.59 |
| 22.9545 | 28.59 |
| 22.959 | 28.583 |
| 22.9635 | 28.583 |
| 22.968 | 28.575 |
| 22.9725 | 28.575 |
| 22.977 | 28.568 |
| 22.9815 | 28.568 |
| 22.986 | 28.561 |
| 22.9905 | 28.553 |
| 22.995 | 28.553 |
| 22.9995 | 28.546 |
| 23.004 | 28.546 |
| 23.0085 | 28.538 |
| 23.013 | 28.538 |
| 23.0175 | 28.531 |
| 23.022 | 28.527 |
| 23.0265 | 28.524 |
| 23.031 | 28.516 |
| 23.0355 | 28.516 |
| 23.04 | 28.509 |
| 23.0445 | 28.509 |
| 23.049 | 28.502 |
| 23.0535 | 28.502 |
| 23.058 | 28.497 |
| 23.0625 | 28.491 |
| 23.067 | 28.491 |
| 23.0715 | 28.486 |
| 23.076 | 28.486 |
| 23.0805 | 28.481 |
| 23.085 | 28.481 |
| 23.0895 | 28.475 |
| 23.094 | 28.475 |
| 23.0985 | 28.47 |
| 23.103 | 28.464 |
| 23.1075 | 28.464 |
| 23.112 | 28.459 |
| 23.1165 | 28.459 |
| 23.121 | 28.454 |
| 23.1255 | 28.454 |
| 23.13 | 28.448 |
| 23.1345 | 28.448 |
| 23.139 | 28.443 |
| 23.1435 | 28.437 |
| 23.148 | 28.437 |
| 23.1525 | 28.43 |
| 23.157 | 28.43 |
| 23.1615 | 28.422 |
| 23.166 | 28.422 |
| 23.1705 | 28.414 |
| 23.175 | 28.41 |
| 23.1795 | 28.406 |
| 23.184 | 28.397 |
| 23.1885 | 28.397 |
| 23.193 | 28.389 |
| 23.1975 | 28.389 |
| 23.202 | 28.381 |
| 23.2065 | 28.381 |
| 23.211 | 28.373 |
| 23.2155 | 28.365 |
| 23.22 | 28.365 |
| 23.2245 | 28.356 |
| 23.229 | 28.356 |
| 23.2335 | 28.348 |
| 23.238 | 28.348 |
| 23.2425 | 28.34 |
| 23.247 | 28.34 |
| 23.2515 | 28.332 |
| 23.256 | 28.322 |
| 23.2605 | 28.322 |
| 23.265 | 28.311 |
| 23.2695 | 28.311 |
| 23.274 | 28.3 |
| 23.2785 | 28.3 |
| 23.283 | 28.29 |
| 23.2875 | 28.29 |
| 23.292 | 28.279 |
| 23.2965 | 28.268 |
| 23.301 | 28.268 |
| 23.3055 | 28.257 |
| 23.31 | 28.257 |
| 23.3145 | 28.247 |
| 23.319 | 28.247 |
| 23.3235 | 28.236 |
| 23.328 | 28.225 |
| 23.3325 | 28.225 |
| 23.337 | 28.215 |
| 23.3415 | 28.215 |
| 23.346 | 28.204 |
| 23.3505 | 28.204 |
| 23.355 | 28.193 |
| 23.3595 | 28.193 |
| 23.364 | 28.183 |
| 23.3685 | 28.174 |
| 23.373 | 28.174 |
| 23.3775 | 28.164 |
| 23.382 | 28.164 |
| 23.3865 | 28.154 |
| 23.391 | 28.154 |
| 23.3955 | 28.144 |
| 23.4 | 28.144 |
| 23.4045 | 28.134 |
| 23.409 | 28.124 |
| 23.4135 | 28.124 |
| 23.418 | 28.115 |
| 23.4225 | 28.115 |
| 23.427 | 28.105 |
| 23.4315 | 28.105 |
| 23.436 | 28.095 |
| 23.4405 | 28.095 |
| 23.445 | 28.085 |
| 23.4495 | 28.076 |
| 23.454 | 28.076 |
| 23.4585 | 28.066 |
| 23.463 | 28.066 |
| 23.4675 | 28.058 |
| 23.472 | 28.058 |
| 23.4765 | 28.051 |
| 23.481 | 28.044 |
| 23.4855 | 28.044 |
| 23.49 | 28.037 |
| 23.4945 | 28.037 |
| 23.499 | 28.03 |
| 23.5035 | 28.03 |
| 23.508 | 28.023 |
| 23.5125 | 28.023 |
| 23.517 | 28.016 |
| 23.5215 | 28.009 |
| 23.526 | 28.009 |
| 23.5305 | 28.002 |
| 23.535 | 28.002 |
| 23.5395 | 27.995 |
| 23.544 | 27.995 |
| 23.5485 | 27.988 |
| 23.553 | 27.988 |
| 23.5575 | 27.981 |
| 23.562 | 27.974 |
| 23.5665 | 27.974 |
| 23.571 | 27.969 |
| 23.5755 | 27.969 |
| 23.58 | 27.966 |
| 23.5845 | 27.966 |
| 23.589 | 27.963 |
| 23.5935 | 27.963 |
| 23.598 | 27.961 |
| 23.6025 | 27.958 |
| 23.607 | 27.958 |
| 23.6115 | 27.955 |
| 23.616 | 27.955 |
| 23.6205 | 27.953 |
| 23.625 | 27.953 |
| 23.6295 | 27.95 |
| 23.634 | 27.947 |
| 23.6385 | 27.947 |
| 23.643 | 27.944 |
| 23.6475 | 27.944 |
| 23.652 | 27.942 |
| 23.6565 | 27.942 |
| 23.661 | 27.939 |
| 23.6655 | 27.939 |
| 23.67 | 27.936 |
| 23.6745 | 27.936 |
| 23.679 | 27.936 |
| 23.6835 | 27.94 |
| 23.688 | 27.94 |
| 23.6925 | 27.946 |
| 23.697 | 27.946 |
| 23.7015 | 27.953 |
| 23.706 | 27.953 |
| 23.7105 | 27.959 |
| 23.715 | 27.965 |
| 23.7195 | 27.965 |
| 23.724 | 27.972 |
| 23.7285 | 27.972 |
| 23.733 | 27.978 |
| 23.7375 | 27.978 |
| 23.742 | 27.984 |
| 23.7465 | 27.987 |
| 23.751 | 27.99 |
| 23.7555 | 27.997 |
| 23.76 | 27.997 |
| 23.7645 | 28.003 |
| 23.769 | 28.003 |
| 23.7735 | 28.009 |
| 23.778 | 28.009 |
| 23.7825 | 28.016 |
| 23.787 | 28.03 |
| 23.7915 | 28.03 |
| 23.796 | 28.052 |
| 23.8005 | 28.052 |
| 23.805 | 28.074 |
| 23.8095 | 28.074 |
| 23.814 | 28.096 |
| 23.8185 | 28.096 |
| 23.823 | 28.118 |
| 23.8275 | 28.14 |
| 23.832 | 28.14 |
| 23.8365 | 28.162 |
| 23.841 | 28.162 |
| 23.8455 | 28.183 |
| 23.85 | 28.183 |
| 23.8545 | 28.205 |
| 23.859 | 28.205 |
| 23.8635 | 28.227 |
| 23.868 | 28.249 |
| 23.8725 | 28.249 |
| 23.877 | 28.271 |
| 23.8815 | 28.271 |
| 23.886 | 28.292 |
| 23.8905 | 28.292 |
| 23.895 | 28.318 |
| 23.8995 | 28.332 |
| 23.904 | 28.352 |
| 23.9085 | 28.392 |
| 23.913 | 28.392 |
| 23.9175 | 28.431 |
| 23.922 | 28.431 |
| 23.9265 | 28.471 |
| 23.931 | 28.471 |
| 23.9355 | 28.51 |
| 23.94 | 28.55 |
| 23.9445 | 28.55 |
| 23.949 | 28.589 |
| 23.9535 | 28.589 |
| 23.958 | 28.628 |
| 23.9625 | 28.628 |
| 23.967 | 28.668 |
| 23.9715 | 28.668 |
| 23.976 | 28.707 |
| 23.9805 | 28.746 |
| 23.985 | 28.746 |
| 23.9895 | 28.786 |
| 23.994 | 28.786 |
| 23.9985 | 28.825 |
| 24.003 | 28.825 |
| 24.0075 | 28.868 |
| 24.012 | 28.868 |
| 24.0165 | 28.917 |
| 24.021 | 28.968 |
| 24.0255 | 28.968 |
| 24.03 | 29.019 |
| 24.0345 | 29.019 |
| 24.039 | 29.071 |
| 24.0435 | 29.071 |
| 24.048 | 29.121 |
| 24.0525 | 29.172 |
| 24.057 | 29.172 |
| 24.0615 | 29.223 |
| 24.066 | 29.223 |
| 24.0705 | 29.274 |
| 24.075 | 29.274 |
| 24.0795 | 29.325 |
| 24.084 | 29.325 |
| 24.0885 | 29.376 |
| 24.093 | 29.427 |
| 24.0975 | 29.427 |
| 24.102 | 29.477 |
| 24.1065 | 29.477 |
| 24.111 | 29.528 |
| 24.1155 | 29.528 |
| 24.12 | 29.579 |
| 24.1245 | 29.579 |
| 24.129 | 29.629 |
| 24.1335 | 29.679 |
| 24.138 | 29.679 |
| 24.1425 | 29.729 |
| 24.147 | 29.729 |
| 24.1515 | 29.779 |
| 24.156 | 29.779 |
| 24.1605 | 29.829 |
| 24.165 | 29.829 |
| 24.1695 | 29.879 |
| 24.174 | 29.929 |
| 24.1785 | 29.929 |
| 24.183 | 29.979 |
| 24.1875 | 29.979 |
| 24.192 | 30.029 |
| 24.1965 | 30.029 |
| 24.201 | 30.079 |
| 24.2055 | 30.129 |
| 24.21 | 30.129 |
| 24.2145 | 30.178 |
| 24.219 | 30.178 |
| 24.2235 | 30.228 |
| 24.228 | 30.228 |
| 24.2325 | 30.271 |
| 24.237 | 30.271 |
| 24.2415 | 30.306 |
| 24.246 | 30.339 |
| 24.2505 | 30.339 |
| 24.255 | 30.372 |
| 24.2595 | 30.372 |
| 24.264 | 30.405 |
| 24.2685 | 30.405 |
| 24.273 | 30.438 |
| 24.2775 | 30.438 |
| 24.282 | 30.47 |
| 24.2865 | 30.503 |
| 24.291 | 30.503 |
| 24.2955 | 30.536 |
| 24.3 | 30.536 |
| 24.3045 | 30.569 |
| 24.309 | 30.569 |
| 24.3135 | 30.602 |
| 24.318 | 30.618 |
| 24.3225 | 30.634 |
| 24.327 | 30.667 |
| 24.3315 | 30.667 |
| 24.336 | 30.7 |
| 24.3405 | 30.7 |
| 24.345 | 30.722 |
| 24.3495 | 30.722 |
| 24.354 | 30.73 |
| 24.3585 | 30.733 |
| 24.363 | 30.733 |
| 24.3675 | 30.735 |
| 24.372 | 30.735 |
| 24.3765 | 30.738 |
| 24.381 | 30.738 |
| 24.3855 | 30.74 |
| 24.39 | 30.74 |
| 24.3945 | 30.743 |
| 24.399 | 30.746 |
| 24.4035 | 30.746 |
| 24.408 | 30.748 |
| 24.4125 | 30.748 |
| 24.417 | 30.751 |
| 24.4215 | 30.751 |
| 24.426 | 30.754 |
| 24.4305 | 30.754 |
| 24.435 | 30.756 |
| 24.4395 | 30.759 |
| 24.444 | 30.759 |
| 24.4485 | 30.761 |
| 24.453 | 30.761 |
| 24.4575 | 30.758 |
| 24.462 | 30.758 |
| 24.4665 | 30.739 |
| 24.471 | 30.724 |
| 24.4755 | 30.71 |
| 24.48 | 30.681 |
| 24.4845 | 30.681 |
| 24.489 | 30.653 |
| 24.4935 | 30.653 |
| 24.498 | 30.624 |
| 24.5025 | 30.624 |
| 24.507 | 30.596 |
| 24.5115 | 30.567 |
| 24.516 | 30.567 |
| 24.5205 | 30.539 |
| 24.525 | 30.539 |
| 24.5295 | 30.51 |
| 24.534 | 30.51 |
| 24.5385 | 30.482 |
| 24.543 | 30.482 |
| 24.5475 | 30.453 |
| 24.552 | 30.425 |
| 24.5565 | 30.425 |
| 24.561 | 30.397 |
| 24.5655 | 30.397 |
| 24.57 | 30.368 |
| 24.5745 | 30.368 |
| 24.579 | 30.329 |
| 24.5835 | 30.329 |
| 24.588 | 30.279 |
| 24.5925 | 30.229 |
| 24.597 | 30.229 |
| 24.6015 | 30.179 |
| 24.606 | 30.179 |
| 24.6105 | 30.13 |
| 24.615 | 30.13 |
| 24.6195 | 30.08 |
| 24.624 | 30.03 |
| 24.6285 | 30.03 |
| 24.633 | 29.98 |
| 24.6375 | 29.98 |
| 24.642 | 29.931 |
| 24.6465 | 29.931 |
| 24.651 | 29.881 |
| 24.6555 | 29.881 |
| 24.66 | 29.831 |
| 24.6645 | 29.782 |
| 24.669 | 29.782 |
| 24.6735 | 29.732 |
| 24.678 | 29.732 |
| 24.6825 | 29.683 |
| 24.687 | 29.683 |
| 24.6915 | 29.63 |
| 24.696 | 29.63 |
| 24.7005 | 29.572 |
| 24.705 | 29.511 |
| 24.7095 | 29.511 |
| 24.714 | 29.449 |
| 24.7185 | 29.449 |
| 24.723 | 29.388 |
| 24.7275 | 29.388 |
| 24.732 | 29.326 |
| 24.7365 | 29.326 |
| 24.741 | 29.265 |
| 24.7455 | 29.204 |
| 24.75 | 29.204 |
| 24.7545 | 29.142 |
| 24.759 | 29.142 |
| 24.7635 | 29.081 |
| 24.768 | 29.081 |
| 24.7725 | 29.02 |
| 24.777 | 28.959 |
| 24.7815 | 28.959 |
| 24.786 | 28.898 |
| 24.7905 | 28.898 |
| 24.795 | 28.837 |
| 24.7995 | 28.837 |
| 24.804 | 28.776 |
| 24.8085 | 28.776 |
| 24.813 | 28.712 |
| 24.8175 | 28.643 |
| 24.822 | 28.643 |
| 24.8265 | 28.574 |
| 24.831 | 28.574 |
| 24.8355 | 28.505 |
| 24.84 | 28.505 |
| 24.8445 | 28.436 |
| 24.849 | 28.436 |
| 24.8535 | 28.367 |
| 24.858 | 28.299 |
| 24.8625 | 28.299 |
| 24.867 | 28.23 |
| 24.8715 | 28.23 |
| 24.876 | 28.161 |
| 24.8805 | 28.161 |
| 24.885 | 28.092 |
| 24.8895 | 28.092 |
| 24.894 | 28.024 |
| 24.8985 | 27.955 |
| 24.903 | 27.955 |
| 24.9075 | 27.886 |
| 24.912 | 27.886 |
| 24.9165 | 27.818 |
| 24.921 | 27.818 |
| 24.9255 | 27.749 |
| 24.93 | 27.678 |
| 24.9345 | 27.678 |
| 24.939 | 27.605 |
| 24.9435 | 27.605 |
| 24.948 | 27.531 |
| 24.9525 | 27.531 |
| 24.957 | 27.457 |
| 24.9615 | 27.457 |
| 24.966 | 27.384 |